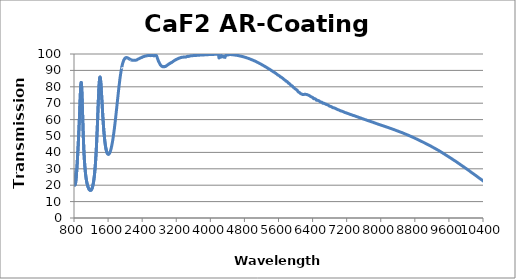
| Category | Transmission (%) |
|---|---|
| 200.0 | 0.033 |
| 201.0 | 0.027 |
| 202.0 | 0.167 |
| 203.0 | 0.082 |
| 204.0 | 0.026 |
| 205.0 | 0.047 |
| 206.0 | 0.007 |
| 207.0 | 0.018 |
| 208.0 | 0.015 |
| 209.0 | 0.054 |
| 210.0 | 0.017 |
| 211.0 | 0.037 |
| 212.0 | 0.004 |
| 213.0 | 0.027 |
| 214.0 | 0.066 |
| 215.0 | 0.053 |
| 216.0 | 0.029 |
| 217.0 | 0.021 |
| 218.0 | 0.008 |
| 219.0 | 0.008 |
| 220.0 | 0.019 |
| 221.0 | 0.018 |
| 222.0 | 0.022 |
| 223.0 | 0.002 |
| 224.0 | 0.004 |
| 225.0 | 0.002 |
| 226.0 | 0.004 |
| 227.0 | 0.005 |
| 228.0 | 0.017 |
| 229.0 | 0.013 |
| 230.0 | 0 |
| 231.0 | 0.016 |
| 232.0 | 0.002 |
| 233.0 | 0.011 |
| 234.0 | 0.014 |
| 235.0 | 0.017 |
| 236.0 | 0.003 |
| 237.0 | 0.003 |
| 238.0 | 0.008 |
| 239.0 | 0.016 |
| 240.0 | 0.025 |
| 241.0 | 0.003 |
| 242.0 | 0.002 |
| 243.0 | 0.017 |
| 244.0 | 0.006 |
| 245.0 | 0.002 |
| 246.0 | 0.021 |
| 247.0 | 0.016 |
| 248.0 | 0.028 |
| 249.0 | 0.011 |
| 250.0 | 0.015 |
| 251.0 | 0.023 |
| 252.0 | 0.007 |
| 253.0 | 0.01 |
| 254.0 | 0.027 |
| 255.0 | 0.018 |
| 256.0 | 0.022 |
| 257.0 | 0.023 |
| 258.0 | 0.031 |
| 259.0 | 0.031 |
| 260.0 | 0.016 |
| 261.0 | 0.036 |
| 262.0 | 0.011 |
| 263.0 | 0.002 |
| 264.0 | 0.042 |
| 265.0 | 0.028 |
| 266.0 | 0.01 |
| 267.0 | 0.006 |
| 268.0 | 0.004 |
| 269.0 | 0.027 |
| 270.0 | 0.057 |
| 271.0 | 0.071 |
| 272.0 | 0.015 |
| 273.0 | 0.032 |
| 274.0 | 0.012 |
| 275.0 | 0.021 |
| 276.0 | 0.032 |
| 277.0 | 0.045 |
| 278.0 | 0.02 |
| 279.0 | 0.052 |
| 280.0 | 0.111 |
| 281.0 | 0.018 |
| 282.0 | 0.074 |
| 283.0 | 0.111 |
| 284.0 | 0.049 |
| 285.0 | 0.11 |
| 286.0 | 0.096 |
| 287.0 | 0.013 |
| 288.0 | 0.062 |
| 289.0 | 0.074 |
| 290.0 | 0.068 |
| 291.0 | 0.09 |
| 292.0 | 0.079 |
| 293.0 | 0.039 |
| 294.0 | 0.057 |
| 295.0 | 0.016 |
| 296.0 | 0.049 |
| 297.0 | 0.02 |
| 298.0 | 0.048 |
| 299.0 | 0.026 |
| 300.0 | 0.107 |
| 301.0 | 0.006 |
| 302.0 | 0.021 |
| 303.0 | 0.059 |
| 304.0 | 0.002 |
| 305.0 | 0.089 |
| 306.0 | 0.003 |
| 307.0 | 0.089 |
| 308.0 | 0.062 |
| 309.0 | 0.141 |
| 310.0 | 0.074 |
| 311.0 | 0.009 |
| 312.0 | 0.006 |
| 313.0 | 0.021 |
| 314.0 | 0.014 |
| 315.0 | 0.157 |
| 316.0 | 0.097 |
| 317.0 | 0.043 |
| 318.0 | 0.079 |
| 319.0 | 0.043 |
| 320.0 | 0.047 |
| 321.0 | 0.052 |
| 322.0 | 0.001 |
| 323.0 | 0.1 |
| 324.0 | 0.015 |
| 325.0 | 0.006 |
| 326.0 | 0 |
| 327.0 | 0.063 |
| 328.0 | 0.081 |
| 329.0 | 0.046 |
| 330.0 | 0.069 |
| 331.0 | 0.044 |
| 332.0 | 0.093 |
| 333.0 | 0.023 |
| 334.0 | 0.093 |
| 335.0 | 0.002 |
| 336.0 | 0.102 |
| 337.0 | 0.052 |
| 338.0 | 0.014 |
| 339.0 | 0.044 |
| 340.0 | 0 |
| 341.0 | 0.047 |
| 342.0 | 0.032 |
| 343.0 | 0.06 |
| 344.0 | 0.025 |
| 345.0 | 0.042 |
| 346.0 | 0.011 |
| 347.0 | 0.087 |
| 348.0 | 0.039 |
| 349.0 | 0.083 |
| 350.0 | 0.086 |
| 351.0 | 0.006 |
| 352.0 | 0.047 |
| 353.0 | 0.011 |
| 354.0 | 0.018 |
| 355.0 | 0.041 |
| 356.0 | 0.07 |
| 357.0 | 0.045 |
| 358.0 | 0.006 |
| 359.0 | 0.012 |
| 360.0 | 0.06 |
| 361.0 | 0.018 |
| 362.0 | 0.067 |
| 363.0 | 0.032 |
| 364.0 | 0.031 |
| 365.0 | 0.077 |
| 366.0 | 0.008 |
| 367.0 | 0.008 |
| 368.0 | 0.013 |
| 369.0 | 0.021 |
| 370.0 | 0.013 |
| 371.0 | 0.044 |
| 372.0 | 0.007 |
| 373.0 | 0.009 |
| 374.0 | 0.004 |
| 375.0 | 0.061 |
| 376.0 | 0.032 |
| 377.0 | 0.003 |
| 378.0 | 0.01 |
| 379.0 | 0.014 |
| 380.0 | 0.018 |
| 381.0 | 0.02 |
| 382.0 | 0.007 |
| 383.0 | 0.005 |
| 384.0 | 0.026 |
| 385.0 | 0.003 |
| 386.0 | 0.034 |
| 387.0 | 0.017 |
| 388.0 | 0.03 |
| 389.0 | 0.006 |
| 390.0 | 0.011 |
| 391.0 | 0.006 |
| 392.0 | 0.009 |
| 393.0 | 0.007 |
| 394.0 | 0.01 |
| 395.0 | 0.013 |
| 396.0 | 0.015 |
| 397.0 | 0.019 |
| 398.0 | 0.001 |
| 399.0 | 0.004 |
| 400.0 | 0.003 |
| 401.0 | 0.026 |
| 402.0 | 0.017 |
| 403.0 | 0.009 |
| 404.0 | 0.012 |
| 405.0 | 0.011 |
| 406.0 | 0.004 |
| 407.0 | 0.009 |
| 408.0 | 0.007 |
| 409.0 | 0.016 |
| 410.0 | 0.004 |
| 411.0 | 0.002 |
| 412.0 | 0.001 |
| 413.0 | 0.003 |
| 414.0 | 0.007 |
| 415.0 | 0.012 |
| 416.0 | 0.012 |
| 417.0 | 0.01 |
| 418.0 | 0.003 |
| 419.0 | 0.016 |
| 420.0 | 0.01 |
| 421.0 | 0.011 |
| 422.0 | 0.008 |
| 423.0 | 0.001 |
| 424.0 | 0.008 |
| 425.0 | 0.007 |
| 426.0 | 0.009 |
| 427.0 | 0.006 |
| 428.0 | 0.007 |
| 429.0 | 0.007 |
| 430.0 | 0.014 |
| 431.0 | 0.011 |
| 432.0 | 0.01 |
| 433.0 | 0.011 |
| 434.0 | 0.005 |
| 435.0 | 0.002 |
| 436.0 | 0.001 |
| 437.0 | 0.006 |
| 438.0 | 0.006 |
| 439.0 | 0.015 |
| 440.0 | 0.008 |
| 441.0 | 0.013 |
| 442.0 | 0.009 |
| 443.0 | 0.007 |
| 444.0 | 0.016 |
| 445.0 | 0.017 |
| 446.0 | 0.011 |
| 447.0 | 0.013 |
| 448.0 | 0.012 |
| 449.0 | 0.019 |
| 450.0 | 0.018 |
| 451.0 | 0.023 |
| 452.0 | 0.023 |
| 453.0 | 0.027 |
| 454.0 | 0.038 |
| 455.0 | 0.049 |
| 456.0 | 0.054 |
| 457.0 | 0.074 |
| 458.0 | 0.096 |
| 459.0 | 0.117 |
| 460.0 | 0.154 |
| 461.0 | 0.196 |
| 462.0 | 0.257 |
| 463.0 | 0.325 |
| 464.0 | 0.414 |
| 465.0 | 0.526 |
| 466.0 | 0.673 |
| 467.0 | 0.835 |
| 468.0 | 1.047 |
| 469.0 | 1.292 |
| 470.0 | 1.572 |
| 471.0 | 1.907 |
| 472.0 | 2.293 |
| 473.0 | 2.732 |
| 474.0 | 3.243 |
| 475.0 | 3.814 |
| 476.0 | 4.452 |
| 477.0 | 5.146 |
| 478.0 | 5.889 |
| 479.0 | 6.687 |
| 480.0 | 7.515 |
| 481.0 | 8.355 |
| 482.0 | 9.21 |
| 483.0 | 10.075 |
| 484.0 | 10.935 |
| 485.0 | 11.788 |
| 486.0 | 12.61 |
| 487.0 | 13.417 |
| 488.0 | 14.18 |
| 489.0 | 14.876 |
| 490.0 | 15.496 |
| 491.0 | 16.009 |
| 492.0 | 16.396 |
| 493.0 | 16.64 |
| 494.0 | 16.73 |
| 495.0 | 16.663 |
| 496.0 | 16.438 |
| 497.0 | 16.077 |
| 498.0 | 15.589 |
| 499.0 | 15 |
| 500.0 | 14.341 |
| 501.0 | 13.627 |
| 502.0 | 12.887 |
| 503.0 | 12.142 |
| 504.0 | 11.401 |
| 505.0 | 10.683 |
| 506.0 | 9.993 |
| 507.0 | 9.339 |
| 508.0 | 8.737 |
| 509.0 | 8.187 |
| 510.0 | 7.676 |
| 511.0 | 7.223 |
| 512.0 | 6.819 |
| 513.0 | 6.469 |
| 514.0 | 6.171 |
| 515.0 | 5.917 |
| 516.0 | 5.719 |
| 517.0 | 5.559 |
| 518.0 | 5.451 |
| 519.0 | 5.386 |
| 520.0 | 5.369 |
| 521.0 | 5.394 |
| 522.0 | 5.472 |
| 523.0 | 5.597 |
| 524.0 | 5.772 |
| 525.0 | 5.998 |
| 526.0 | 6.283 |
| 527.0 | 6.618 |
| 528.0 | 7.008 |
| 529.0 | 7.45 |
| 530.0 | 7.938 |
| 531.0 | 8.46 |
| 532.0 | 9.001 |
| 533.0 | 9.568 |
| 534.0 | 10.151 |
| 535.0 | 10.737 |
| 536.0 | 11.33 |
| 537.0 | 11.935 |
| 538.0 | 12.531 |
| 539.0 | 13.115 |
| 540.0 | 13.662 |
| 541.0 | 14.165 |
| 542.0 | 14.628 |
| 543.0 | 15.046 |
| 544.0 | 15.427 |
| 545.0 | 15.786 |
| 546.0 | 16.136 |
| 547.0 | 16.461 |
| 548.0 | 16.75 |
| 549.0 | 16.989 |
| 550.0 | 17.15 |
| 551.0 | 17.202 |
| 552.0 | 17.142 |
| 553.0 | 16.961 |
| 554.0 | 16.674 |
| 555.0 | 16.29 |
| 556.0 | 15.832 |
| 557.0 | 15.316 |
| 558.0 | 14.752 |
| 559.0 | 14.171 |
| 560.0 | 13.566 |
| 561.0 | 12.956 |
| 562.0 | 12.362 |
| 563.0 | 11.796 |
| 564.0 | 11.267 |
| 565.0 | 10.791 |
| 566.0 | 10.373 |
| 567.0 | 10.022 |
| 568.0 | 9.73 |
| 569.0 | 9.508 |
| 570.0 | 9.358 |
| 571.0 | 9.271 |
| 572.0 | 9.246 |
| 573.0 | 9.281 |
| 574.0 | 9.377 |
| 575.0 | 9.53 |
| 576.0 | 9.752 |
| 577.0 | 10.033 |
| 578.0 | 10.372 |
| 579.0 | 10.781 |
| 580.0 | 11.255 |
| 581.0 | 11.797 |
| 582.0 | 12.41 |
| 583.0 | 13.091 |
| 584.0 | 13.855 |
| 585.0 | 14.699 |
| 586.0 | 15.608 |
| 587.0 | 16.615 |
| 588.0 | 17.701 |
| 589.0 | 18.865 |
| 590.0 | 20.124 |
| 591.0 | 21.474 |
| 592.0 | 22.923 |
| 593.0 | 24.473 |
| 594.0 | 26.105 |
| 595.0 | 27.857 |
| 596.0 | 29.736 |
| 597.0 | 31.72 |
| 598.0 | 33.804 |
| 599.0 | 36.019 |
| 600.0 | 38.36 |
| 601.0 | 40.806 |
| 602.0 | 43.331 |
| 603.0 | 45.99 |
| 604.0 | 48.732 |
| 605.0 | 51.514 |
| 606.0 | 54.374 |
| 607.0 | 57.284 |
| 608.0 | 60.188 |
| 609.0 | 63.08 |
| 610.0 | 65.935 |
| 611.0 | 68.758 |
| 612.0 | 71.517 |
| 613.0 | 74.132 |
| 614.0 | 76.629 |
| 615.0 | 78.992 |
| 616.0 | 81.182 |
| 617.0 | 83.187 |
| 618.0 | 84.996 |
| 619.0 | 86.604 |
| 620.0 | 87.993 |
| 621.0 | 89.145 |
| 622.0 | 90.085 |
| 623.0 | 90.801 |
| 624.0 | 91.263 |
| 625.0 | 91.48 |
| 626.0 | 91.474 |
| 627.0 | 91.25 |
| 628.0 | 90.79 |
| 629.0 | 90.109 |
| 630.0 | 89.24 |
| 631.0 | 88.144 |
| 632.0 | 86.879 |
| 633.0 | 85.461 |
| 634.0 | 83.873 |
| 635.0 | 82.158 |
| 636.0 | 80.351 |
| 637.0 | 78.481 |
| 638.0 | 76.52 |
| 639.0 | 74.516 |
| 640.0 | 72.505 |
| 641.0 | 70.496 |
| 642.0 | 68.497 |
| 643.0 | 66.522 |
| 644.0 | 64.595 |
| 645.0 | 62.719 |
| 646.0 | 60.908 |
| 647.0 | 59.145 |
| 648.0 | 57.493 |
| 649.0 | 55.9 |
| 650.0 | 54.371 |
| 651.0 | 52.936 |
| 652.0 | 51.592 |
| 653.0 | 50.34 |
| 654.0 | 49.158 |
| 655.0 | 48.064 |
| 656.0 | 47.051 |
| 657.0 | 46.122 |
| 658.0 | 45.275 |
| 659.0 | 44.511 |
| 660.0 | 43.82 |
| 661.0 | 43.22 |
| 662.0 | 42.686 |
| 663.0 | 42.224 |
| 664.0 | 41.846 |
| 665.0 | 41.531 |
| 666.0 | 41.29 |
| 667.0 | 41.122 |
| 668.0 | 41.017 |
| 669.0 | 40.983 |
| 670.0 | 41.003 |
| 671.0 | 41.094 |
| 672.0 | 41.248 |
| 673.0 | 41.47 |
| 674.0 | 41.748 |
| 675.0 | 42.069 |
| 676.0 | 42.465 |
| 677.0 | 42.913 |
| 678.0 | 43.413 |
| 679.0 | 43.96 |
| 680.0 | 44.553 |
| 681.0 | 45.188 |
| 682.0 | 45.879 |
| 683.0 | 46.598 |
| 684.0 | 47.348 |
| 685.0 | 48.126 |
| 686.0 | 48.926 |
| 687.0 | 49.751 |
| 688.0 | 50.576 |
| 689.0 | 51.422 |
| 690.0 | 52.256 |
| 691.0 | 53.061 |
| 692.0 | 53.875 |
| 693.0 | 54.653 |
| 694.0 | 55.398 |
| 695.0 | 56.1 |
| 696.0 | 56.743 |
| 697.0 | 57.337 |
| 698.0 | 57.861 |
| 699.0 | 58.309 |
| 700.0 | 58.673 |
| 701.0 | 58.945 |
| 702.0 | 59.144 |
| 703.0 | 59.247 |
| 704.0 | 59.255 |
| 705.0 | 59.166 |
| 706.0 | 58.988 |
| 707.0 | 58.741 |
| 708.0 | 58.407 |
| 709.0 | 57.985 |
| 710.0 | 57.5 |
| 711.0 | 56.956 |
| 712.0 | 56.34 |
| 713.0 | 55.691 |
| 714.0 | 54.998 |
| 715.0 | 54.27 |
| 716.0 | 53.501 |
| 717.0 | 52.718 |
| 718.0 | 51.932 |
| 719.0 | 51.137 |
| 720.0 | 50.395 |
| 721.0 | 49.564 |
| 722.0 | 48.768 |
| 723.0 | 48.002 |
| 724.0 | 47.218 |
| 725.0 | 46.456 |
| 726.0 | 45.724 |
| 727.0 | 44.992 |
| 728.0 | 44.286 |
| 729.0 | 43.632 |
| 730.0 | 42.979 |
| 731.0 | 42.343 |
| 732.0 | 41.753 |
| 733.0 | 41.164 |
| 734.0 | 40.61 |
| 735.0 | 40.089 |
| 736.0 | 39.585 |
| 737.0 | 39.091 |
| 738.0 | 38.641 |
| 739.0 | 38.202 |
| 740.0 | 37.779 |
| 741.0 | 37.381 |
| 742.0 | 37.013 |
| 743.0 | 36.638 |
| 744.0 | 36.302 |
| 745.0 | 35.97 |
| 746.0 | 35.649 |
| 747.0 | 35.338 |
| 748.0 | 35.06 |
| 749.0 | 34.777 |
| 750.0 | 34.506 |
| 751.0 | 34.247 |
| 752.0 | 33.988 |
| 753.0 | 33.729 |
| 754.0 | 33.499 |
| 755.0 | 33.259 |
| 756.0 | 33.022 |
| 757.0 | 32.799 |
| 758.0 | 32.563 |
| 759.0 | 32.332 |
| 760.0 | 32.11 |
| 761.0 | 31.88 |
| 762.0 | 31.644 |
| 763.0 | 31.414 |
| 764.0 | 31.184 |
| 765.0 | 30.939 |
| 766.0 | 30.7 |
| 767.0 | 30.457 |
| 768.0 | 30.213 |
| 769.0 | 29.96 |
| 770.0 | 29.718 |
| 771.0 | 29.449 |
| 772.0 | 29.189 |
| 773.0 | 28.932 |
| 774.0 | 28.667 |
| 775.0 | 28.397 |
| 776.0 | 28.131 |
| 777.0 | 27.855 |
| 778.0 | 27.57 |
| 779.0 | 27.302 |
| 780.0 | 27.033 |
| 781.0 | 26.749 |
| 782.0 | 26.471 |
| 783.0 | 26.197 |
| 784.0 | 25.924 |
| 785.0 | 25.643 |
| 786.0 | 25.38 |
| 787.0 | 25.113 |
| 788.0 | 24.841 |
| 789.0 | 24.592 |
| 790.0 | 24.327 |
| 791.0 | 24.077 |
| 792.0 | 23.831 |
| 793.0 | 23.587 |
| 794.0 | 23.352 |
| 795.0 | 23.126 |
| 796.0 | 22.904 |
| 797.0 | 22.683 |
| 798.0 | 22.476 |
| 799.0 | 22.284 |
| 800.0 | 22.074 |
| 801.0 | 21.892 |
| 802.0 | 21.713 |
| 803.0 | 21.55 |
| 804.0 | 21.385 |
| 805.0 | 21.24 |
| 806.0 | 21.095 |
| 807.0 | 20.964 |
| 808.0 | 20.845 |
| 809.0 | 20.722 |
| 810.0 | 20.615 |
| 811.0 | 20.526 |
| 812.0 | 20.442 |
| 813.0 | 20.364 |
| 814.0 | 20.298 |
| 815.0 | 20.235 |
| 816.0 | 20.193 |
| 817.0 | 20.155 |
| 818.0 | 20.128 |
| 819.0 | 20.106 |
| 820.0 | 20.1 |
| 821.0 | 20.103 |
| 822.0 | 20.112 |
| 823.0 | 20.135 |
| 824.0 | 20.162 |
| 825.0 | 20.198 |
| 826.0 | 20.253 |
| 827.0 | 20.312 |
| 828.0 | 20.38 |
| 829.0 | 20.463 |
| 830.0 | 20.543 |
| 831.0 | 20.644 |
| 832.0 | 20.752 |
| 833.0 | 20.867 |
| 834.0 | 20.991 |
| 835.0 | 21.125 |
| 836.0 | 21.272 |
| 837.0 | 21.426 |
| 838.0 | 21.592 |
| 839.0 | 21.76 |
| 840.0 | 21.941 |
| 841.0 | 22.14 |
| 842.0 | 22.341 |
| 843.0 | 22.541 |
| 844.0 | 22.76 |
| 845.0 | 22.987 |
| 846.0 | 23.223 |
| 847.0 | 23.475 |
| 848.0 | 23.732 |
| 849.0 | 23.983 |
| 850.0 | 24.254 |
| 851.0 | 24.541 |
| 852.0 | 24.824 |
| 853.0 | 25.119 |
| 854.0 | 25.431 |
| 855.0 | 25.733 |
| 856.0 | 26.049 |
| 857.0 | 26.39 |
| 858.0 | 26.717 |
| 859.0 | 27.053 |
| 860.0 | 27.415 |
| 861.0 | 27.768 |
| 862.0 | 28.133 |
| 863.0 | 28.5 |
| 864.0 | 28.879 |
| 865.0 | 29.249 |
| 866.0 | 29.652 |
| 867.0 | 30.057 |
| 868.0 | 30.441 |
| 869.0 | 30.854 |
| 870.0 | 31.267 |
| 871.0 | 31.685 |
| 872.0 | 32.112 |
| 873.0 | 32.545 |
| 874.0 | 32.966 |
| 875.0 | 33.396 |
| 876.0 | 33.846 |
| 877.0 | 34.284 |
| 878.0 | 34.743 |
| 879.0 | 35.195 |
| 880.0 | 35.648 |
| 881.0 | 36.099 |
| 882.0 | 36.569 |
| 883.0 | 37.04 |
| 884.0 | 37.484 |
| 885.0 | 37.977 |
| 886.0 | 38.453 |
| 887.0 | 38.926 |
| 888.0 | 39.406 |
| 889.0 | 39.892 |
| 890.0 | 40.368 |
| 891.0 | 40.865 |
| 892.0 | 41.374 |
| 893.0 | 41.853 |
| 894.0 | 42.332 |
| 895.0 | 42.849 |
| 896.0 | 43.342 |
| 897.0 | 43.858 |
| 898.0 | 44.368 |
| 899.0 | 44.87 |
| 900.0 | 45.378 |
| 901.0 | 45.898 |
| 902.0 | 46.427 |
| 903.0 | 46.931 |
| 904.0 | 47.472 |
| 905.0 | 48.002 |
| 906.0 | 48.521 |
| 907.0 | 49.068 |
| 908.0 | 49.624 |
| 909.0 | 50.14 |
| 910.0 | 50.702 |
| 911.0 | 51.275 |
| 912.0 | 51.822 |
| 913.0 | 52.392 |
| 914.0 | 52.97 |
| 915.0 | 53.523 |
| 916.0 | 54.112 |
| 917.0 | 54.723 |
| 918.0 | 55.303 |
| 919.0 | 55.892 |
| 920.0 | 56.501 |
| 921.0 | 57.129 |
| 922.0 | 57.728 |
| 923.0 | 58.378 |
| 924.0 | 59.012 |
| 925.0 | 59.617 |
| 926.0 | 60.276 |
| 927.0 | 60.922 |
| 928.0 | 61.571 |
| 929.0 | 62.238 |
| 930.0 | 62.906 |
| 931.0 | 63.559 |
| 932.0 | 64.222 |
| 933.0 | 64.923 |
| 934.0 | 65.582 |
| 935.0 | 66.284 |
| 936.0 | 66.988 |
| 937.0 | 67.664 |
| 938.0 | 68.342 |
| 939.0 | 69.02 |
| 940.0 | 69.695 |
| 941.0 | 70.379 |
| 942.0 | 71.077 |
| 943.0 | 71.753 |
| 944.0 | 72.396 |
| 945.0 | 73.071 |
| 946.0 | 73.734 |
| 947.0 | 74.359 |
| 948.0 | 75.002 |
| 949.0 | 75.626 |
| 950.0 | 76.209 |
| 951.0 | 76.801 |
| 952.0 | 77.369 |
| 953.0 | 77.918 |
| 954.0 | 78.453 |
| 955.0 | 78.959 |
| 956.0 | 79.414 |
| 957.0 | 79.873 |
| 958.0 | 80.308 |
| 959.0 | 80.7 |
| 960.0 | 81.04 |
| 961.0 | 81.391 |
| 962.0 | 81.676 |
| 963.0 | 81.931 |
| 964.0 | 82.139 |
| 965.0 | 82.308 |
| 966.0 | 82.446 |
| 967.0 | 82.538 |
| 968.0 | 82.61 |
| 969.0 | 82.612 |
| 970.0 | 82.582 |
| 971.0 | 82.492 |
| 972.0 | 82.379 |
| 973.0 | 82.203 |
| 974.0 | 81.995 |
| 975.0 | 81.731 |
| 976.0 | 81.427 |
| 977.0 | 81.092 |
| 978.0 | 80.704 |
| 979.0 | 80.294 |
| 980.0 | 79.815 |
| 981.0 | 79.309 |
| 982.0 | 78.781 |
| 983.0 | 78.207 |
| 984.0 | 77.6 |
| 985.0 | 76.99 |
| 986.0 | 76.302 |
| 987.0 | 75.588 |
| 988.0 | 74.901 |
| 989.0 | 74.172 |
| 990.0 | 73.37 |
| 991.0 | 72.628 |
| 992.0 | 71.805 |
| 993.0 | 70.968 |
| 994.0 | 70.177 |
| 995.0 | 69.347 |
| 996.0 | 68.466 |
| 997.0 | 67.629 |
| 998.0 | 66.76 |
| 999.0 | 65.887 |
| 1000.0 | 65.022 |
| 1000.9999999999999 | 64.162 |
| 1002.0 | 63.293 |
| 1002.9999999999999 | 62.426 |
| 1004.0 | 61.585 |
| 1004.9999999999999 | 60.71 |
| 1006.0 | 59.842 |
| 1006.9999999999999 | 59.012 |
| 1008.0 | 58.174 |
| 1008.9999999999999 | 57.319 |
| 1010.0 | 56.528 |
| 1010.9999999999999 | 55.687 |
| 1012.0 | 54.857 |
| 1012.9999999999999 | 54.094 |
| 1014.0 | 53.292 |
| 1014.9999999999999 | 52.513 |
| 1016.0 | 51.756 |
| 1016.9999999999999 | 51.016 |
| 1018.0 | 50.258 |
| 1018.9999999999999 | 49.54 |
| 1020.0 | 48.834 |
| 1020.9999999999999 | 48.123 |
| 1022.0 | 47.434 |
| 1022.9999999999999 | 46.769 |
| 1024.0 | 46.09 |
| 1025.0 | 45.428 |
| 1026.0 | 44.815 |
| 1027.0 | 44.181 |
| 1028.0 | 43.552 |
| 1029.0 | 42.972 |
| 1030.0 | 42.373 |
| 1031.0 | 41.784 |
| 1032.0 | 41.233 |
| 1033.0 | 40.68 |
| 1034.0 | 40.132 |
| 1035.0 | 39.606 |
| 1036.0 | 39.088 |
| 1037.0 | 38.566 |
| 1038.0 | 38.072 |
| 1039.0 | 37.603 |
| 1040.0 | 37.123 |
| 1041.0 | 36.659 |
| 1042.0 | 36.213 |
| 1043.0 | 35.761 |
| 1044.0 | 35.325 |
| 1045.0 | 34.912 |
| 1046.0 | 34.494 |
| 1047.0 | 34.081 |
| 1048.0 | 33.712 |
| 1049.0 | 33.323 |
| 1050.0 | 33.275 |
| 1051.0 | 32.914 |
| 1052.0 | 32.549 |
| 1053.0 | 32.192 |
| 1054.0 | 31.854 |
| 1055.0 | 31.515 |
| 1056.0 | 31.174 |
| 1057.0 | 30.852 |
| 1058.0 | 30.54 |
| 1059.0 | 30.233 |
| 1060.0 | 29.929 |
| 1061.0 | 29.631 |
| 1062.0 | 29.335 |
| 1063.0 | 29.049 |
| 1064.0 | 28.778 |
| 1065.0 | 28.504 |
| 1066.0 | 28.231 |
| 1067.0 | 27.975 |
| 1068.0 | 27.72 |
| 1069.0 | 27.465 |
| 1070.0 | 27.226 |
| 1071.0 | 26.985 |
| 1072.0 | 26.745 |
| 1073.0 | 26.519 |
| 1074.0 | 26.285 |
| 1075.0 | 26.062 |
| 1076.0 | 25.857 |
| 1077.0 | 25.652 |
| 1078.0 | 25.441 |
| 1079.0 | 25.253 |
| 1080.0 | 25.047 |
| 1081.0 | 24.854 |
| 1082.0 | 24.672 |
| 1083.0 | 24.49 |
| 1084.0 | 24.309 |
| 1085.0 | 24.127 |
| 1086.0 | 23.96 |
| 1087.0 | 23.804 |
| 1088.0 | 23.608 |
| 1089.0 | 23.469 |
| 1090.0 | 23.297 |
| 1091.0 | 23.139 |
| 1092.0 | 22.996 |
| 1093.0 | 22.847 |
| 1094.0 | 22.692 |
| 1095.0 | 22.555 |
| 1096.0 | 22.406 |
| 1097.0 | 22.277 |
| 1098.0 | 22.146 |
| 1099.0 | 22.002 |
| 1100.0 | 21.884 |
| 1101.0 | 21.741 |
| 1102.0 | 21.624 |
| 1103.0 | 21.486 |
| 1104.0 | 21.371 |
| 1105.0 | 21.25 |
| 1106.0 | 21.133 |
| 1107.0 | 21.013 |
| 1108.0 | 20.928 |
| 1109.0 | 20.805 |
| 1110.0 | 20.698 |
| 1111.0 | 20.592 |
| 1112.0 | 20.507 |
| 1113.0 | 20.364 |
| 1114.0 | 20.285 |
| 1115.0 | 20.199 |
| 1116.0 | 20.09 |
| 1117.0 | 19.984 |
| 1118.0 | 19.902 |
| 1119.0 | 19.811 |
| 1120.0 | 19.721 |
| 1121.0 | 19.621 |
| 1122.0 | 19.561 |
| 1123.0 | 19.461 |
| 1124.0 | 19.39 |
| 1125.0 | 19.294 |
| 1126.0 | 19.223 |
| 1127.0 | 19.129 |
| 1128.0 | 19.067 |
| 1129.0 | 18.994 |
| 1130.0 | 18.904 |
| 1131.0 | 18.849 |
| 1132.0 | 18.77 |
| 1133.0 | 18.702 |
| 1134.0 | 18.627 |
| 1135.0 | 18.568 |
| 1136.0 | 18.506 |
| 1137.0 | 18.427 |
| 1138.0 | 18.368 |
| 1139.0 | 18.304 |
| 1140.0 | 18.239 |
| 1141.0 | 18.188 |
| 1142.0 | 18.128 |
| 1143.0 | 18.074 |
| 1144.0 | 18.002 |
| 1145.0 | 17.978 |
| 1146.0 | 17.911 |
| 1147.0 | 17.849 |
| 1148.0 | 17.815 |
| 1149.0 | 17.763 |
| 1150.0 | 17.702 |
| 1151.0 | 17.677 |
| 1152.0 | 17.625 |
| 1153.0 | 17.583 |
| 1154.0 | 17.52 |
| 1155.0 | 17.493 |
| 1156.0 | 17.453 |
| 1157.0 | 17.392 |
| 1158.0 | 17.386 |
| 1159.0 | 17.34 |
| 1160.0 | 17.305 |
| 1161.0 | 17.276 |
| 1162.0 | 17.241 |
| 1163.0 | 17.204 |
| 1164.0 | 17.178 |
| 1165.0 | 17.152 |
| 1166.0 | 17.123 |
| 1167.0 | 17.097 |
| 1168.0 | 17.078 |
| 1169.0 | 17.049 |
| 1170.0 | 17.028 |
| 1171.0 | 17.007 |
| 1172.0 | 16.992 |
| 1173.0 | 16.966 |
| 1174.0 | 16.955 |
| 1175.0 | 16.938 |
| 1176.0 | 16.924 |
| 1177.0 | 16.905 |
| 1178.0 | 16.904 |
| 1179.0 | 16.893 |
| 1180.0 | 16.885 |
| 1181.0 | 16.873 |
| 1182.0 | 16.872 |
| 1183.0 | 16.868 |
| 1184.0 | 16.861 |
| 1185.0 | 16.862 |
| 1186.0 | 16.862 |
| 1187.0 | 16.864 |
| 1188.0 | 16.869 |
| 1189.0 | 16.872 |
| 1190.0 | 16.885 |
| 1191.0 | 16.885 |
| 1192.0 | 16.899 |
| 1193.0 | 16.906 |
| 1194.0 | 16.92 |
| 1195.0 | 16.933 |
| 1196.0 | 16.954 |
| 1197.0 | 16.966 |
| 1198.0 | 16.986 |
| 1199.0 | 17.008 |
| 1200.0 | 17.042 |
| 1201.0 | 17.033 |
| 1202.0 | 17.075 |
| 1203.0 | 17.103 |
| 1204.0 | 17.128 |
| 1205.0 | 17.16 |
| 1206.0 | 17.193 |
| 1207.0 | 17.226 |
| 1208.0 | 17.265 |
| 1209.0 | 17.305 |
| 1210.0 | 17.342 |
| 1211.0 | 17.385 |
| 1212.0 | 17.419 |
| 1213.0 | 17.473 |
| 1214.0 | 17.529 |
| 1215.0 | 17.572 |
| 1216.0 | 17.623 |
| 1217.0 | 17.673 |
| 1218.0 | 17.718 |
| 1219.0 | 17.785 |
| 1220.0 | 17.862 |
| 1221.0 | 17.913 |
| 1222.0 | 17.97 |
| 1223.0 | 18.039 |
| 1224.0 | 18.107 |
| 1225.0 | 18.175 |
| 1226.0 | 18.249 |
| 1227.0 | 18.305 |
| 1228.0 | 18.419 |
| 1229.0 | 18.479 |
| 1230.0 | 18.56 |
| 1231.0 | 18.647 |
| 1232.0 | 18.731 |
| 1233.0 | 18.822 |
| 1234.0 | 18.911 |
| 1235.0 | 19.005 |
| 1236.0 | 19.1 |
| 1237.0 | 19.2 |
| 1238.0 | 19.3 |
| 1239.0 | 19.403 |
| 1240.0 | 19.512 |
| 1241.0 | 19.618 |
| 1242.0 | 19.728 |
| 1243.0 | 19.844 |
| 1244.0 | 19.957 |
| 1245.0 | 20.079 |
| 1246.0 | 20.208 |
| 1247.0 | 20.329 |
| 1248.0 | 20.455 |
| 1249.0 | 20.593 |
| 1250.0 | 20.721 |
| 1251.0 | 20.838 |
| 1252.0 | 21.019 |
| 1253.0 | 21.144 |
| 1254.0 | 21.288 |
| 1255.0 | 21.439 |
| 1256.0 | 21.588 |
| 1257.0 | 21.747 |
| 1258.0 | 21.907 |
| 1259.0 | 22.067 |
| 1260.0 | 22.232 |
| 1261.0 | 22.405 |
| 1262.0 | 22.592 |
| 1263.0 | 22.746 |
| 1264.0 | 22.916 |
| 1265.0 | 23.115 |
| 1266.0 | 23.298 |
| 1267.0 | 23.493 |
| 1268.0 | 23.685 |
| 1269.0 | 23.878 |
| 1270.0 | 24.083 |
| 1271.0 | 24.295 |
| 1272.0 | 24.499 |
| 1273.0 | 24.717 |
| 1274.0 | 24.929 |
| 1275.0 | 25.15 |
| 1276.0 | 25.375 |
| 1277.0 | 25.615 |
| 1278.0 | 25.844 |
| 1279.0 | 26.079 |
| 1280.0 | 26.325 |
| 1281.0 | 26.572 |
| 1282.0 | 26.823 |
| 1283.0 | 27.082 |
| 1284.0 | 27.346 |
| 1285.0 | 27.602 |
| 1286.0 | 27.874 |
| 1287.0 | 28.159 |
| 1288.0 | 28.428 |
| 1289.0 | 28.712 |
| 1290.0 | 29.018 |
| 1291.0 | 29.298 |
| 1292.0 | 29.602 |
| 1293.0 | 29.912 |
| 1294.0 | 30.216 |
| 1295.0 | 30.527 |
| 1296.0 | 30.864 |
| 1297.0 | 31.185 |
| 1298.0 | 31.511 |
| 1299.0 | 31.847 |
| 1300.0 | 32.195 |
| 1301.0 | 32.538 |
| 1302.0 | 32.894 |
| 1303.0 | 33.264 |
| 1304.0 | 33.617 |
| 1305.0 | 33.995 |
| 1306.0 | 34.382 |
| 1307.0 | 34.752 |
| 1308.0 | 35.157 |
| 1309.0 | 35.556 |
| 1310.0 | 35.945 |
| 1311.0 | 36.362 |
| 1312.0 | 36.78 |
| 1313.0 | 37.194 |
| 1314.0 | 37.623 |
| 1315.0 | 38.069 |
| 1316.0 | 38.511 |
| 1317.0 | 38.949 |
| 1318.0 | 39.406 |
| 1319.0 | 39.865 |
| 1320.0 | 40.328 |
| 1321.0 | 40.808 |
| 1322.0 | 41.291 |
| 1323.0 | 41.763 |
| 1324.0 | 42.26 |
| 1325.0 | 42.763 |
| 1326.0 | 43.256 |
| 1327.0 | 43.785 |
| 1328.0 | 44.312 |
| 1329.0 | 44.819 |
| 1330.0 | 45.354 |
| 1331.0 | 45.901 |
| 1332.0 | 46.437 |
| 1333.0 | 46.991 |
| 1334.0 | 47.563 |
| 1335.0 | 48.116 |
| 1336.0 | 48.685 |
| 1337.0 | 49.267 |
| 1338.0 | 49.848 |
| 1339.0 | 50.429 |
| 1340.0 | 51.041 |
| 1341.0 | 51.637 |
| 1342.0 | 52.236 |
| 1343.0 | 52.84 |
| 1344.0 | 53.45 |
| 1345.0 | 54.055 |
| 1346.0 | 54.698 |
| 1347.0 | 55.335 |
| 1348.0 | 55.95 |
| 1349.0 | 56.587 |
| 1350.0 | 57.213 |
| 1351.0 | 57.845 |
| 1352.0 | 58.5 |
| 1353.0 | 59.174 |
| 1354.0 | 59.812 |
| 1355.0 | 60.469 |
| 1356.0 | 61.128 |
| 1357.0 | 61.79 |
| 1358.0 | 62.45 |
| 1359.0 | 63.135 |
| 1360.0 | 63.81 |
| 1361.0 | 64.496 |
| 1362.0 | 65.187 |
| 1363.0 | 65.904 |
| 1364.0 | 66.559 |
| 1365.0 | 67.273 |
| 1366.0 | 67.946 |
| 1367.0 | 68.586 |
| 1368.0 | 69.249 |
| 1369.0 | 69.907 |
| 1370.0 | 70.565 |
| 1371.0 | 71.215 |
| 1372.0 | 71.884 |
| 1373.0 | 72.474 |
| 1374.0 | 73.062 |
| 1375.0 | 73.635 |
| 1376.0 | 74.201 |
| 1377.0 | 74.755 |
| 1378.0 | 75.322 |
| 1379.0 | 75.88 |
| 1380.0 | 76.445 |
| 1381.0 | 77.056 |
| 1382.0 | 77.651 |
| 1383.0 | 78.219 |
| 1384.0 | 78.79 |
| 1385.0 | 79.327 |
| 1386.0 | 79.796 |
| 1387.0 | 80.253 |
| 1388.0 | 80.694 |
| 1389.0 | 81.076 |
| 1390.0 | 81.531 |
| 1391.0 | 81.908 |
| 1392.0 | 82.271 |
| 1393.0 | 82.65 |
| 1394.0 | 83.002 |
| 1395.0 | 83.33 |
| 1396.0 | 83.65 |
| 1397.0 | 83.977 |
| 1398.0 | 84.235 |
| 1399.0 | 84.498 |
| 1400.0 | 84.701 |
| 1401.0 | 84.931 |
| 1402.0 | 85.115 |
| 1403.0 | 85.283 |
| 1404.0 | 85.421 |
| 1405.0 | 85.566 |
| 1406.0 | 85.642 |
| 1407.0 | 85.769 |
| 1408.0 | 85.838 |
| 1409.0 | 85.867 |
| 1410.0 | 85.88 |
| 1411.0 | 85.931 |
| 1412.0 | 85.848 |
| 1413.0 | 85.779 |
| 1414.0 | 85.709 |
| 1415.0 | 85.667 |
| 1416.0 | 85.561 |
| 1417.0 | 85.45 |
| 1418.0 | 85.343 |
| 1419.0 | 85.156 |
| 1420.0 | 84.831 |
| 1421.0 | 84.784 |
| 1422.0 | 84.573 |
| 1423.0 | 84.349 |
| 1424.0 | 84.116 |
| 1425.0 | 83.85 |
| 1426.0 | 83.582 |
| 1427.0 | 83.316 |
| 1428.0 | 83.011 |
| 1429.0 | 82.693 |
| 1430.0 | 82.367 |
| 1431.0 | 82.047 |
| 1432.0 | 81.694 |
| 1433.0 | 81.412 |
| 1434.0 | 80.969 |
| 1435.0 | 80.575 |
| 1436.0 | 80.211 |
| 1437.0 | 79.826 |
| 1438.0 | 79.417 |
| 1439.0 | 78.99 |
| 1440.0 | 78.584 |
| 1441.0 | 78.15 |
| 1442.0 | 77.726 |
| 1443.0 | 77.299 |
| 1444.0 | 76.842 |
| 1445.0 | 76.399 |
| 1446.0 | 75.946 |
| 1447.0 | 75.489 |
| 1448.0 | 75.033 |
| 1449.0 | 74.575 |
| 1450.0 | 74.11 |
| 1451.0 | 73.639 |
| 1452.0 | 73.191 |
| 1453.0 | 72.713 |
| 1454.0 | 72.23 |
| 1455.0 | 71.762 |
| 1456.0 | 71.307 |
| 1457.0 | 70.827 |
| 1458.0 | 70.362 |
| 1459.0 | 69.936 |
| 1460.0 | 69.426 |
| 1461.0 | 68.947 |
| 1462.0 | 68.519 |
| 1463.0 | 68.044 |
| 1464.0 | 67.573 |
| 1465.0 | 67.082 |
| 1466.0 | 66.771 |
| 1467.0 | 66.2 |
| 1468.0 | 65.761 |
| 1469.0 | 65.309 |
| 1470.0 | 64.845 |
| 1471.0 | 64.409 |
| 1472.0 | 63.971 |
| 1473.0 | 63.538 |
| 1474.0 | 63.105 |
| 1475.0 | 62.649 |
| 1476.0 | 62.232 |
| 1477.0 | 61.823 |
| 1478.0 | 61.415 |
| 1479.0 | 60.986 |
| 1480.0 | 60.565 |
| 1481.0 | 60.17 |
| 1482.0 | 59.762 |
| 1483.0 | 59.369 |
| 1484.0 | 58.974 |
| 1485.0 | 58.57 |
| 1486.0 | 58.185 |
| 1487.0 | 57.814 |
| 1488.0 | 57.438 |
| 1489.0 | 57.049 |
| 1490.0 | 56.693 |
| 1491.0 | 56.318 |
| 1492.0 | 55.962 |
| 1493.0 | 55.615 |
| 1494.0 | 55.268 |
| 1495.0 | 54.915 |
| 1496.0 | 54.57 |
| 1497.0 | 54.25 |
| 1498.0 | 53.914 |
| 1499.0 | 53.572 |
| 1500.0 | 53.26 |
| 1501.0 | 52.946 |
| 1502.0 | 52.626 |
| 1503.0 | 52.29 |
| 1504.0 | 52.003 |
| 1505.0 | 51.7 |
| 1506.0 | 51.415 |
| 1507.0 | 51.172 |
| 1508.0 | 50.834 |
| 1509.0 | 50.559 |
| 1510.0 | 50.27 |
| 1511.0 | 49.994 |
| 1512.0 | 49.731 |
| 1513.0 | 49.387 |
| 1514.0 | 49.24 |
| 1515.0 | 48.942 |
| 1516.0 | 48.69 |
| 1517.0 | 48.434 |
| 1518.0 | 48.172 |
| 1519.0 | 47.953 |
| 1520.0 | 47.745 |
| 1521.0 | 47.479 |
| 1522.0 | 47.225 |
| 1523.0 | 47.024 |
| 1524.0 | 46.818 |
| 1525.0 | 46.583 |
| 1526.0 | 46.355 |
| 1527.0 | 46.154 |
| 1528.0 | 45.971 |
| 1529.0 | 45.766 |
| 1530.0 | 45.549 |
| 1531.0 | 45.317 |
| 1532.0 | 45.177 |
| 1533.0 | 44.983 |
| 1534.0 | 44.789 |
| 1535.0 | 44.599 |
| 1536.0 | 44.419 |
| 1537.0 | 44.196 |
| 1538.0 | 44.125 |
| 1539.0 | 43.907 |
| 1540.0 | 43.743 |
| 1541.0 | 43.541 |
| 1542.0 | 43.412 |
| 1543.0 | 43.261 |
| 1544.0 | 43.184 |
| 1545.0 | 42.965 |
| 1546.0 | 42.817 |
| 1547.0 | 42.622 |
| 1548.0 | 42.552 |
| 1549.0 | 42.405 |
| 1550.0 | 42.269 |
| 1551.0 | 42.117 |
| 1552.0 | 42.004 |
| 1553.0 | 41.881 |
| 1554.0 | 41.782 |
| 1555.0 | 41.617 |
| 1556.0 | 41.511 |
| 1557.0 | 41.405 |
| 1558.0 | 41.324 |
| 1559.0 | 41.166 |
| 1560.0 | 41.079 |
| 1561.0 | 40.976 |
| 1562.0 | 40.898 |
| 1563.0 | 40.761 |
| 1564.0 | 40.684 |
| 1565.0 | 40.588 |
| 1566.0 | 40.529 |
| 1567.0 | 40.379 |
| 1568.0 | 40.33 |
| 1569.0 | 40.25 |
| 1570.0 | 40.165 |
| 1571.0 | 40.096 |
| 1572.0 | 40.004 |
| 1573.0 | 39.946 |
| 1574.0 | 39.87 |
| 1575.0 | 39.807 |
| 1576.0 | 39.74 |
| 1577.0 | 39.671 |
| 1578.0 | 39.618 |
| 1579.0 | 39.556 |
| 1580.0 | 39.502 |
| 1581.0 | 39.442 |
| 1582.0 | 39.394 |
| 1583.0 | 39.349 |
| 1584.0 | 39.318 |
| 1585.0 | 39.237 |
| 1586.0 | 39.201 |
| 1587.0 | 39.166 |
| 1588.0 | 39.152 |
| 1589.0 | 39.081 |
| 1590.0 | 39.063 |
| 1591.0 | 39.033 |
| 1592.0 | 39.03 |
| 1593.0 | 38.951 |
| 1594.0 | 38.948 |
| 1595.0 | 38.923 |
| 1596.0 | 38.924 |
| 1597.0 | 38.858 |
| 1598.0 | 38.86 |
| 1599.0 | 38.85 |
| 1600.0 | 38.837 |
| 1601.0 | 38.818 |
| 1602.0 | 38.823 |
| 1603.0 | 38.811 |
| 1604.0 | 38.809 |
| 1605.0 | 38.81 |
| 1606.0 | 38.774 |
| 1607.0 | 38.795 |
| 1608.0 | 38.809 |
| 1609.0 | 38.803 |
| 1610.0 | 38.803 |
| 1611.0 | 38.791 |
| 1612.0 | 38.845 |
| 1613.0 | 38.837 |
| 1614.0 | 38.832 |
| 1615.0 | 38.869 |
| 1616.0 | 38.883 |
| 1617.0 | 38.898 |
| 1618.0 | 38.892 |
| 1619.0 | 38.953 |
| 1620.0 | 38.973 |
| 1621.0 | 38.984 |
| 1622.0 | 38.987 |
| 1623.0 | 39.07 |
| 1624.0 | 39.084 |
| 1625.0 | 39.11 |
| 1626.0 | 39.11 |
| 1627.0 | 39.207 |
| 1628.0 | 39.217 |
| 1629.0 | 39.257 |
| 1630.0 | 39.299 |
| 1631.0 | 39.333 |
| 1632.0 | 39.377 |
| 1633.0 | 39.423 |
| 1634.0 | 39.476 |
| 1635.0 | 39.535 |
| 1636.0 | 39.566 |
| 1637.0 | 39.622 |
| 1638.0 | 39.684 |
| 1639.0 | 39.736 |
| 1640.0 | 39.796 |
| 1641.0 | 39.844 |
| 1642.0 | 39.922 |
| 1643.0 | 39.973 |
| 1644.0 | 40.037 |
| 1645.0 | 40.086 |
| 1646.0 | 40.169 |
| 1647.0 | 40.28 |
| 1648.0 | 40.315 |
| 1649.0 | 40.386 |
| 1650.0 | 40.41 |
| 1651.0 | 40.554 |
| 1652.0 | 40.601 |
| 1653.0 | 40.686 |
| 1654.0 | 40.754 |
| 1655.0 | 40.854 |
| 1656.0 | 40.93 |
| 1657.0 | 40.999 |
| 1658.0 | 41.112 |
| 1659.0 | 41.196 |
| 1660.0 | 41.28 |
| 1661.0 | 41.362 |
| 1662.0 | 41.438 |
| 1663.0 | 41.57 |
| 1664.0 | 41.653 |
| 1665.0 | 41.723 |
| 1666.0 | 41.849 |
| 1667.0 | 41.944 |
| 1668.0 | 42.023 |
| 1669.0 | 42.139 |
| 1670.0 | 42.274 |
| 1671.0 | 42.344 |
| 1672.0 | 42.448 |
| 1673.0 | 42.565 |
| 1674.0 | 42.711 |
| 1675.0 | 42.762 |
| 1676.0 | 42.901 |
| 1677.0 | 43.013 |
| 1678.0 | 43.169 |
| 1679.0 | 43.219 |
| 1680.0 | 43.368 |
| 1681.0 | 43.487 |
| 1682.0 | 43.61 |
| 1683.0 | 43.738 |
| 1684.0 | 43.869 |
| 1685.0 | 43.99 |
| 1686.0 | 44.077 |
| 1687.0 | 44.248 |
| 1688.0 | 44.399 |
| 1689.0 | 44.5 |
| 1690.0 | 44.606 |
| 1691.0 | 44.792 |
| 1692.0 | 44.9 |
| 1693.0 | 45.019 |
| 1694.0 | 45.207 |
| 1695.0 | 45.33 |
| 1696.0 | 45.44 |
| 1697.0 | 45.618 |
| 1698.0 | 45.767 |
| 1699.0 | 45.893 |
| 1700.0 | 46.012 |
| 1701.0 | 46.217 |
| 1702.0 | 46.34 |
| 1703.0 | 46.495 |
| 1704.0 | 46.648 |
| 1705.0 | 46.798 |
| 1706.0 | 46.945 |
| 1707.0 | 47.113 |
| 1708.0 | 47.257 |
| 1709.0 | 47.425 |
| 1710.0 | 47.595 |
| 1711.0 | 47.754 |
| 1712.0 | 47.911 |
| 1713.0 | 48.058 |
| 1714.0 | 48.267 |
| 1715.0 | 48.418 |
| 1716.0 | 48.547 |
| 1717.0 | 48.766 |
| 1718.0 | 48.927 |
| 1719.0 | 49.097 |
| 1720.0 | 49.259 |
| 1721.0 | 49.444 |
| 1722.0 | 49.613 |
| 1723.0 | 49.792 |
| 1724.0 | 49.968 |
| 1725.0 | 50.156 |
| 1726.0 | 50.338 |
| 1727.0 | 50.545 |
| 1728.0 | 50.662 |
| 1729.0 | 50.888 |
| 1730.0 | 51.07 |
| 1731.0 | 51.26 |
| 1732.0 | 51.449 |
| 1733.0 | 51.653 |
| 1734.0 | 51.837 |
| 1735.0 | 52.021 |
| 1736.0 | 52.225 |
| 1737.0 | 52.391 |
| 1738.0 | 52.605 |
| 1739.0 | 52.809 |
| 1740.0 | 53.028 |
| 1741.0 | 53.168 |
| 1742.0 | 53.408 |
| 1743.0 | 53.626 |
| 1744.0 | 53.798 |
| 1745.0 | 53.999 |
| 1746.0 | 54.214 |
| 1747.0 | 54.452 |
| 1748.0 | 54.609 |
| 1749.0 | 54.833 |
| 1750.0 | 55.056 |
| 1751.0 | 55.292 |
| 1752.0 | 55.434 |
| 1753.0 | 55.68 |
| 1754.0 | 55.923 |
| 1755.0 | 56.085 |
| 1756.0 | 56.321 |
| 1757.0 | 56.544 |
| 1758.0 | 56.756 |
| 1759.0 | 56.928 |
| 1760.0 | 57.232 |
| 1761.0 | 57.428 |
| 1762.0 | 57.633 |
| 1763.0 | 57.861 |
| 1764.0 | 58.064 |
| 1765.0 | 58.321 |
| 1766.0 | 58.532 |
| 1767.0 | 58.742 |
| 1768.0 | 58.984 |
| 1769.0 | 59.219 |
| 1770.0 | 59.448 |
| 1771.0 | 59.678 |
| 1772.0 | 59.907 |
| 1773.0 | 60.134 |
| 1774.0 | 60.368 |
| 1775.0 | 60.59 |
| 1776.0 | 60.832 |
| 1777.0 | 61.032 |
| 1778.0 | 61.296 |
| 1779.0 | 61.592 |
| 1780.0 | 61.773 |
| 1781.0 | 61.996 |
| 1782.0 | 62.235 |
| 1783.0 | 62.494 |
| 1784.0 | 62.719 |
| 1785.0 | 62.95 |
| 1786.0 | 63.198 |
| 1787.0 | 63.429 |
| 1788.0 | 63.662 |
| 1789.0 | 63.928 |
| 1790.0 | 64.149 |
| 1791.0 | 64.39 |
| 1792.0 | 64.637 |
| 1793.0 | 64.878 |
| 1794.0 | 65.123 |
| 1795.0 | 65.369 |
| 1796.0 | 65.594 |
| 1797.0 | 65.847 |
| 1798.0 | 66.085 |
| 1799.0 | 66.322 |
| 1800.0 | 66.588 |
| 1801.0 | 66.813 |
| 1802.0 | 67.082 |
| 1803.0 | 67.301 |
| 1804.0 | 67.55 |
| 1805.0 | 67.782 |
| 1806.0 | 68.036 |
| 1807.0 | 68.274 |
| 1808.0 | 68.533 |
| 1809.0 | 68.777 |
| 1810.0 | 69.024 |
| 1811.0 | 69.277 |
| 1812.0 | 69.513 |
| 1813.0 | 69.746 |
| 1814.0 | 70 |
| 1815.0 | 70.244 |
| 1816.0 | 70.49 |
| 1817.0 | 70.739 |
| 1818.0 | 70.996 |
| 1819.0 | 71.247 |
| 1820.0 | 71.5 |
| 1821.0 | 71.745 |
| 1822.0 | 71.989 |
| 1823.0 | 72.229 |
| 1824.0 | 72.481 |
| 1825.0 | 72.724 |
| 1826.0 | 72.975 |
| 1827.0 | 73.217 |
| 1828.0 | 73.444 |
| 1829.0 | 73.682 |
| 1830.0 | 73.92 |
| 1831.0 | 74.163 |
| 1832.0 | 74.39 |
| 1833.0 | 74.639 |
| 1834.0 | 74.9 |
| 1835.0 | 75.136 |
| 1836.0 | 75.391 |
| 1837.0 | 75.647 |
| 1838.0 | 75.873 |
| 1839.0 | 76.131 |
| 1840.0 | 76.38 |
| 1841.0 | 76.614 |
| 1842.0 | 76.86 |
| 1843.0 | 77.114 |
| 1844.0 | 77.343 |
| 1845.0 | 77.576 |
| 1846.0 | 77.801 |
| 1847.0 | 78.039 |
| 1848.0 | 78.285 |
| 1849.0 | 78.513 |
| 1850.0 | 78.745 |
| 1851.0 | 78.955 |
| 1852.0 | 79.182 |
| 1853.0 | 79.421 |
| 1854.0 | 79.663 |
| 1855.0 | 79.893 |
| 1856.0 | 80.106 |
| 1857.0 | 80.323 |
| 1858.0 | 80.546 |
| 1859.0 | 80.77 |
| 1860.0 | 80.991 |
| 1861.0 | 81.205 |
| 1862.0 | 81.404 |
| 1863.0 | 81.592 |
| 1864.0 | 81.797 |
| 1865.0 | 82.005 |
| 1866.0 | 82.206 |
| 1867.0 | 82.416 |
| 1868.0 | 82.634 |
| 1869.0 | 82.87 |
| 1870.0 | 83.1 |
| 1871.0 | 83.342 |
| 1872.0 | 83.563 |
| 1873.0 | 83.814 |
| 1874.0 | 84.064 |
| 1875.0 | 84.281 |
| 1876.0 | 84.48 |
| 1877.0 | 84.677 |
| 1878.0 | 84.862 |
| 1879.0 | 85.065 |
| 1880.0 | 85.233 |
| 1881.0 | 85.406 |
| 1882.0 | 85.58 |
| 1883.0 | 85.762 |
| 1884.0 | 85.95 |
| 1885.0 | 86.135 |
| 1886.0 | 86.304 |
| 1887.0 | 86.477 |
| 1888.0 | 86.666 |
| 1889.0 | 86.863 |
| 1890.0 | 87.043 |
| 1891.0 | 87.211 |
| 1892.0 | 87.383 |
| 1893.0 | 87.543 |
| 1894.0 | 87.73 |
| 1895.0 | 87.891 |
| 1896.0 | 88.072 |
| 1897.0 | 88.222 |
| 1898.0 | 88.383 |
| 1899.0 | 88.563 |
| 1900.0 | 88.745 |
| 1901.0 | 88.928 |
| 1902.0 | 89.115 |
| 1903.0 | 89.263 |
| 1904.0 | 89.402 |
| 1905.0 | 89.586 |
| 1906.0 | 89.737 |
| 1907.0 | 89.97 |
| 1908.0 | 90.051 |
| 1909.0 | 90.206 |
| 1910.0 | 90.354 |
| 1911.0 | 90.483 |
| 1912.0 | 90.632 |
| 1913.0 | 90.776 |
| 1914.0 | 90.915 |
| 1915.0 | 91.061 |
| 1916.0 | 91.199 |
| 1917.0 | 91.319 |
| 1918.0 | 91.457 |
| 1919.0 | 91.592 |
| 1920.0 | 91.692 |
| 1921.0 | 91.935 |
| 1922.0 | 91.995 |
| 1923.0 | 91.952 |
| 1924.0 | 92.243 |
| 1925.0 | 92.379 |
| 1926.0 | 92.489 |
| 1927.0 | 92.636 |
| 1928.0 | 92.644 |
| 1929.0 | 92.838 |
| 1930.0 | 92.963 |
| 1931.0 | 93.074 |
| 1932.0 | 93.169 |
| 1933.0 | 93.281 |
| 1934.0 | 93.398 |
| 1935.0 | 93.51 |
| 1936.0 | 93.627 |
| 1937.0 | 93.72 |
| 1938.0 | 93.833 |
| 1939.0 | 93.919 |
| 1940.0 | 94.037 |
| 1941.0 | 94.132 |
| 1942.0 | 94.227 |
| 1943.0 | 94.318 |
| 1944.0 | 94.416 |
| 1945.0 | 94.505 |
| 1946.0 | 94.61 |
| 1947.0 | 94.695 |
| 1948.0 | 94.766 |
| 1949.0 | 94.848 |
| 1950.0 | 94.942 |
| 1951.0 | 95.006 |
| 1952.0 | 95.1 |
| 1953.0 | 95.196 |
| 1954.0 | 95.254 |
| 1955.0 | 95.321 |
| 1956.0 | 95.434 |
| 1957.0 | 95.493 |
| 1958.0 | 95.537 |
| 1959.0 | 95.621 |
| 1960.0 | 95.708 |
| 1961.0 | 95.777 |
| 1962.0 | 95.834 |
| 1963.0 | 95.907 |
| 1964.0 | 95.962 |
| 1965.0 | 95.936 |
| 1966.0 | 96.182 |
| 1967.0 | 96.157 |
| 1968.0 | 96.2 |
| 1969.0 | 96.267 |
| 1970.0 | 96.304 |
| 1971.0 | 96.382 |
| 1972.0 | 96.445 |
| 1973.0 | 96.52 |
| 1974.0 | 96.47 |
| 1975.0 | 96.585 |
| 1976.0 | 96.65 |
| 1977.0 | 96.677 |
| 1978.0 | 96.67 |
| 1979.0 | 96.796 |
| 1980.0 | 96.805 |
| 1981.0 | 96.818 |
| 1982.0 | 96.952 |
| 1983.0 | 96.939 |
| 1984.0 | 96.913 |
| 1985.0 | 97.077 |
| 1986.0 | 97.049 |
| 1987.0 | 97.094 |
| 1988.0 | 97.169 |
| 1989.0 | 97.064 |
| 1990.0 | 97.204 |
| 1991.0 | 97.201 |
| 1992.0 | 97.24 |
| 1993.0 | 97.255 |
| 1994.0 | 97.284 |
| 1995.0 | 97.328 |
| 1996.0 | 97.352 |
| 1997.0 | 97.375 |
| 1998.0 | 97.419 |
| 1999.0 | 97.408 |
| 2000.0 | 97.515 |
| 2001.0 | 97.475 |
| 2001.9999999999998 | 97.399 |
| 2003.0 | 97.503 |
| 2004.0 | 97.541 |
| 2005.0 | 97.63 |
| 2005.9999999999998 | 97.489 |
| 2007.0000000000002 | 97.56 |
| 2008.0 | 97.61 |
| 2009.0 | 97.597 |
| 2009.9999999999998 | 97.66 |
| 2011.0000000000002 | 97.638 |
| 2012.0 | 97.645 |
| 2013.0 | 97.691 |
| 2013.9999999999998 | 97.687 |
| 2015.0000000000002 | 97.672 |
| 2016.0 | 97.722 |
| 2017.0 | 97.696 |
| 2017.9999999999998 | 97.705 |
| 2019.0000000000002 | 97.742 |
| 2020.0 | 97.728 |
| 2021.0 | 97.685 |
| 2021.9999999999998 | 97.762 |
| 2023.0000000000002 | 97.768 |
| 2024.0 | 97.762 |
| 2025.0 | 97.757 |
| 2025.9999999999998 | 97.722 |
| 2027.0000000000002 | 97.737 |
| 2028.0 | 97.753 |
| 2029.0 | 97.811 |
| 2029.9999999999998 | 97.7 |
| 2031.0000000000002 | 97.738 |
| 2032.0 | 97.736 |
| 2033.0 | 97.762 |
| 2033.9999999999998 | 97.752 |
| 2035.0000000000002 | 97.749 |
| 2036.0 | 97.735 |
| 2037.0 | 97.738 |
| 2037.9999999999998 | 97.734 |
| 2039.0000000000002 | 97.739 |
| 2040.0 | 97.723 |
| 2041.0 | 97.739 |
| 2041.9999999999998 | 97.721 |
| 2043.0000000000002 | 97.672 |
| 2044.0 | 97.762 |
| 2045.0 | 97.719 |
| 2045.9999999999998 | 97.69 |
| 2047.0000000000002 | 97.739 |
| 2048.0 | 97.596 |
| 2049.0 | 97.669 |
| 2050.0 | 97.738 |
| 2051.0 | 97.643 |
| 2052.0 | 97.523 |
| 2053.0 | 97.618 |
| 2054.0 | 97.619 |
| 2055.0 | 97.561 |
| 2056.0 | 97.618 |
| 2057.0 | 97.59 |
| 2058.0 | 97.563 |
| 2059.0 | 97.544 |
| 2060.0 | 97.59 |
| 2061.0 | 97.53 |
| 2062.0 | 97.515 |
| 2063.0 | 97.539 |
| 2064.0 | 97.502 |
| 2065.0 | 97.504 |
| 2066.0 | 97.498 |
| 2067.0 | 97.455 |
| 2068.0 | 97.458 |
| 2069.0 | 97.517 |
| 2070.0 | 97.406 |
| 2071.0 | 97.413 |
| 2072.0 | 97.442 |
| 2073.0 | 97.425 |
| 2074.0 | 97.376 |
| 2075.0 | 97.361 |
| 2076.0 | 97.342 |
| 2077.0 | 97.373 |
| 2078.0 | 97.317 |
| 2079.0 | 97.301 |
| 2080.0 | 97.281 |
| 2081.0 | 97.294 |
| 2082.0 | 97.272 |
| 2083.0 | 97.212 |
| 2084.0 | 97.234 |
| 2085.0 | 97.241 |
| 2086.0 | 97.172 |
| 2087.0 | 97.181 |
| 2088.0 | 97.201 |
| 2089.0 | 97.164 |
| 2090.0 | 97.096 |
| 2091.0 | 97.172 |
| 2092.0 | 97.1 |
| 2093.0 | 97.006 |
| 2094.0 | 97.076 |
| 2095.0 | 97.07 |
| 2096.0 | 97.113 |
| 2097.0 | 97.032 |
| 2098.0 | 96.913 |
| 2099.0 | 96.992 |
| 2100.0 | 96.998 |
| 2101.0 | 96.972 |
| 2102.0 | 96.956 |
| 2103.0 | 96.939 |
| 2104.0 | 96.922 |
| 2105.0 | 96.881 |
| 2106.0 | 96.959 |
| 2107.0 | 96.876 |
| 2108.0 | 96.821 |
| 2109.0 | 96.897 |
| 2110.0 | 96.855 |
| 2111.0 | 96.836 |
| 2112.0 | 96.79 |
| 2113.0 | 96.796 |
| 2114.0 | 96.78 |
| 2115.0 | 96.77 |
| 2116.0 | 96.75 |
| 2117.0 | 96.741 |
| 2118.0 | 96.71 |
| 2119.0 | 96.702 |
| 2120.0 | 96.716 |
| 2121.0 | 96.7 |
| 2122.0 | 96.672 |
| 2123.0 | 96.632 |
| 2124.0 | 96.652 |
| 2125.0 | 96.635 |
| 2126.0 | 96.628 |
| 2127.0 | 96.596 |
| 2128.0 | 96.594 |
| 2129.0 | 96.582 |
| 2130.0 | 96.551 |
| 2131.0 | 96.573 |
| 2132.0 | 96.545 |
| 2133.0 | 96.518 |
| 2134.0 | 96.515 |
| 2135.0 | 96.514 |
| 2136.0 | 96.485 |
| 2137.0 | 96.484 |
| 2138.0 | 96.476 |
| 2139.0 | 96.455 |
| 2140.0 | 96.463 |
| 2141.0 | 96.45 |
| 2142.0 | 96.245 |
| 2143.0 | 96.543 |
| 2144.0 | 96.409 |
| 2145.0 | 96.399 |
| 2146.0 | 96.347 |
| 2147.0 | 96.409 |
| 2148.0 | 96.357 |
| 2149.0 | 96.359 |
| 2150.0 | 96.374 |
| 2151.0 | 96.325 |
| 2152.0 | 96.338 |
| 2153.0 | 96.348 |
| 2154.0 | 96.266 |
| 2155.0 | 96.304 |
| 2156.0 | 96.316 |
| 2157.0 | 96.283 |
| 2158.0 | 96.274 |
| 2159.0 | 96.273 |
| 2160.0 | 96.256 |
| 2161.0 | 96.259 |
| 2162.0 | 96.246 |
| 2163.0 | 96.246 |
| 2164.0 | 96.24 |
| 2165.0 | 96.223 |
| 2166.0 | 96.223 |
| 2167.0 | 96.209 |
| 2168.0 | 96.205 |
| 2169.0 | 96.199 |
| 2170.0 | 96.192 |
| 2171.0 | 96.197 |
| 2172.0 | 96.194 |
| 2173.0 | 96.181 |
| 2174.0 | 96.189 |
| 2175.0 | 96.197 |
| 2176.0 | 96.162 |
| 2177.0 | 96.152 |
| 2178.0 | 96.201 |
| 2179.0 | 96.158 |
| 2180.0 | 96.125 |
| 2181.0 | 96.217 |
| 2182.0 | 96.136 |
| 2183.0 | 96.181 |
| 2184.0 | 96.208 |
| 2185.0 | 96.165 |
| 2186.0 | 96.172 |
| 2187.0 | 96.174 |
| 2188.0 | 96.16 |
| 2189.0 | 96.166 |
| 2190.0 | 96.161 |
| 2191.0 | 96.164 |
| 2192.0 | 96.151 |
| 2193.0 | 96.15 |
| 2194.0 | 96.148 |
| 2195.0 | 96.152 |
| 2196.0 | 96.162 |
| 2197.0 | 96.15 |
| 2198.0 | 96.132 |
| 2199.0 | 96.138 |
| 2200.0 | 96.176 |
| 2201.0 | 96.115 |
| 2202.0 | 96.172 |
| 2203.0 | 96.141 |
| 2204.0 | 96.145 |
| 2205.0 | 96.131 |
| 2206.0 | 96.129 |
| 2207.0 | 96.128 |
| 2208.0 | 96.139 |
| 2209.0 | 96.117 |
| 2210.0 | 96.116 |
| 2211.0 | 96.095 |
| 2212.0 | 96.123 |
| 2213.0 | 96.143 |
| 2214.0 | 96.142 |
| 2215.0 | 96.144 |
| 2216.0 | 96.139 |
| 2217.0 | 96.132 |
| 2218.0 | 96.135 |
| 2219.0 | 96.128 |
| 2220.0 | 96.134 |
| 2221.0 | 96.148 |
| 2222.0 | 96.124 |
| 2223.0 | 96.143 |
| 2224.0 | 96.133 |
| 2225.0 | 96.141 |
| 2226.0 | 96.144 |
| 2227.0 | 96.143 |
| 2228.0 | 96.132 |
| 2229.0 | 96.157 |
| 2230.0 | 96.139 |
| 2231.0 | 96.16 |
| 2232.0 | 96.16 |
| 2233.0 | 96.155 |
| 2234.0 | 96.168 |
| 2235.0 | 96.172 |
| 2236.0 | 96.172 |
| 2237.0 | 96.166 |
| 2238.0 | 96.178 |
| 2239.0 | 96.178 |
| 2240.0 | 96.174 |
| 2241.0 | 96.178 |
| 2242.0 | 96.192 |
| 2243.0 | 96.188 |
| 2244.0 | 96.197 |
| 2245.0 | 96.193 |
| 2246.0 | 96.2 |
| 2247.0 | 96.213 |
| 2248.0 | 96.209 |
| 2249.0 | 96.215 |
| 2250.0 | 96.221 |
| 2251.0 | 96.217 |
| 2252.0 | 96.241 |
| 2253.0 | 96.223 |
| 2254.0 | 96.232 |
| 2255.0 | 96.232 |
| 2256.0 | 96.244 |
| 2257.0 | 96.25 |
| 2258.0 | 96.259 |
| 2259.0 | 96.265 |
| 2260.0 | 96.262 |
| 2261.0 | 96.267 |
| 2262.0 | 96.277 |
| 2263.0 | 96.291 |
| 2264.0 | 96.308 |
| 2265.0 | 96.313 |
| 2266.0 | 96.316 |
| 2267.0 | 96.328 |
| 2268.0 | 96.336 |
| 2269.0 | 96.37 |
| 2270.0 | 96.343 |
| 2271.0 | 96.363 |
| 2272.0 | 96.384 |
| 2273.0 | 96.408 |
| 2274.0 | 96.407 |
| 2275.0 | 96.422 |
| 2276.0 | 96.441 |
| 2277.0 | 96.461 |
| 2278.0 | 96.458 |
| 2279.0 | 96.479 |
| 2280.0 | 96.492 |
| 2281.0 | 96.511 |
| 2282.0 | 96.531 |
| 2283.0 | 96.536 |
| 2284.0 | 96.553 |
| 2285.0 | 96.571 |
| 2286.0 | 96.574 |
| 2287.0 | 96.597 |
| 2288.0 | 96.615 |
| 2289.0 | 96.627 |
| 2290.0 | 96.659 |
| 2291.0 | 96.65 |
| 2292.0 | 96.671 |
| 2293.0 | 96.686 |
| 2294.0 | 96.707 |
| 2295.0 | 96.715 |
| 2296.0 | 96.722 |
| 2297.0 | 96.754 |
| 2298.0 | 96.766 |
| 2299.0 | 96.767 |
| 2300.0 | 96.791 |
| 2301.0 | 96.805 |
| 2302.0 | 96.814 |
| 2303.0 | 96.835 |
| 2304.0 | 96.84 |
| 2305.0 | 96.852 |
| 2306.0 | 96.873 |
| 2307.0 | 96.884 |
| 2308.0 | 96.895 |
| 2309.0 | 96.916 |
| 2310.0 | 96.927 |
| 2311.0 | 96.944 |
| 2312.0 | 96.945 |
| 2313.0 | 96.979 |
| 2314.0 | 96.992 |
| 2315.0 | 97.003 |
| 2316.0 | 97.012 |
| 2317.0 | 97.005 |
| 2318.0 | 97.01 |
| 2319.0 | 97.03 |
| 2320.0 | 97.033 |
| 2321.0 | 97.1 |
| 2322.0 | 97.095 |
| 2323.0 | 97.103 |
| 2324.0 | 97.102 |
| 2325.0 | 97.156 |
| 2326.0 | 97.129 |
| 2327.0 | 97.19 |
| 2328.0 | 97.15 |
| 2329.0 | 97.194 |
| 2330.0 | 97.213 |
| 2331.0 | 97.217 |
| 2332.0 | 97.241 |
| 2333.0 | 97.267 |
| 2334.0 | 97.239 |
| 2335.0 | 97.267 |
| 2336.0 | 97.29 |
| 2337.0 | 97.305 |
| 2338.0 | 97.304 |
| 2339.0 | 97.324 |
| 2340.0 | 97.339 |
| 2341.0 | 97.354 |
| 2342.0 | 97.371 |
| 2343.0 | 97.367 |
| 2344.0 | 97.39 |
| 2345.0 | 97.4 |
| 2346.0 | 97.419 |
| 2347.0 | 97.445 |
| 2348.0 | 97.451 |
| 2349.0 | 97.458 |
| 2350.0 | 97.471 |
| 2351.0 | 97.475 |
| 2352.0 | 97.447 |
| 2353.0 | 97.47 |
| 2354.0 | 97.504 |
| 2355.0 | 97.535 |
| 2356.0 | 97.533 |
| 2357.0 | 97.593 |
| 2358.0 | 97.539 |
| 2359.0 | 97.574 |
| 2360.0 | 97.592 |
| 2361.0 | 97.613 |
| 2362.0 | 97.607 |
| 2363.0 | 97.625 |
| 2364.0 | 97.638 |
| 2365.0 | 97.653 |
| 2366.0 | 97.674 |
| 2367.0 | 97.651 |
| 2368.0 | 97.691 |
| 2369.0 | 97.685 |
| 2370.0 | 97.702 |
| 2371.0 | 97.764 |
| 2372.0 | 97.697 |
| 2373.0 | 97.77 |
| 2374.0 | 97.78 |
| 2375.0 | 97.741 |
| 2376.0 | 97.772 |
| 2377.0 | 97.786 |
| 2378.0 | 97.8 |
| 2379.0 | 97.805 |
| 2380.0 | 97.817 |
| 2381.0 | 97.834 |
| 2382.0 | 97.843 |
| 2383.0 | 97.848 |
| 2384.0 | 97.865 |
| 2385.0 | 97.883 |
| 2386.0 | 97.893 |
| 2387.0 | 97.95 |
| 2388.0 | 97.848 |
| 2389.0 | 97.927 |
| 2390.0 | 97.936 |
| 2391.0 | 97.934 |
| 2392.0 | 97.997 |
| 2393.0 | 97.979 |
| 2394.0 | 98.031 |
| 2395.0 | 98.003 |
| 2396.0 | 98.047 |
| 2397.0 | 98.022 |
| 2398.0 | 98.038 |
| 2399.0 | 98.044 |
| 2400.0 | 98.057 |
| 2401.0 | 98.06 |
| 2402.0 | 98.094 |
| 2403.0 | 98.08 |
| 2404.0 | 98.099 |
| 2405.0 | 98.118 |
| 2406.0 | 98.112 |
| 2407.0 | 98.131 |
| 2408.0 | 98.093 |
| 2409.0 | 98.133 |
| 2410.0 | 98.156 |
| 2411.0 | 98.166 |
| 2412.0 | 98.188 |
| 2413.0 | 98.191 |
| 2414.0 | 98.199 |
| 2415.0 | 98.196 |
| 2416.0 | 98.232 |
| 2417.0 | 98.245 |
| 2418.0 | 98.243 |
| 2419.0 | 98.241 |
| 2420.0 | 98.264 |
| 2421.0 | 98.28 |
| 2422.0 | 98.3 |
| 2423.0 | 98.303 |
| 2424.0 | 98.304 |
| 2425.0 | 98.316 |
| 2426.0 | 98.337 |
| 2427.0 | 98.355 |
| 2428.0 | 98.353 |
| 2429.0 | 98.345 |
| 2430.0 | 98.36 |
| 2431.0 | 98.386 |
| 2432.0 | 98.397 |
| 2433.0 | 98.391 |
| 2434.0 | 98.398 |
| 2435.0 | 98.397 |
| 2436.0 | 98.428 |
| 2437.0 | 98.403 |
| 2438.0 | 98.427 |
| 2439.0 | 98.422 |
| 2440.0 | 98.442 |
| 2441.0 | 98.463 |
| 2442.0 | 98.474 |
| 2443.0 | 98.481 |
| 2444.0 | 98.467 |
| 2445.0 | 98.48 |
| 2446.0 | 98.514 |
| 2447.0 | 98.532 |
| 2448.0 | 98.507 |
| 2449.0 | 98.552 |
| 2450.0 | 98.556 |
| 2451.0 | 98.555 |
| 2452.0 | 98.587 |
| 2453.0 | 98.591 |
| 2454.0 | 98.6 |
| 2455.0 | 98.594 |
| 2456.0 | 98.619 |
| 2457.0 | 98.587 |
| 2458.0 | 98.593 |
| 2459.0 | 98.633 |
| 2460.0 | 98.63 |
| 2461.0 | 98.651 |
| 2462.0 | 98.68 |
| 2463.0 | 98.669 |
| 2464.0 | 98.684 |
| 2465.0 | 98.695 |
| 2466.0 | 98.705 |
| 2467.0 | 98.739 |
| 2468.0 | 98.693 |
| 2469.0 | 98.693 |
| 2470.0 | 98.702 |
| 2471.0 | 98.717 |
| 2472.0 | 98.739 |
| 2473.0 | 98.732 |
| 2474.0 | 98.74 |
| 2475.0 | 98.745 |
| 2476.0 | 98.757 |
| 2477.0 | 98.767 |
| 2478.0 | 98.768 |
| 2479.0 | 98.74 |
| 2480.0 | 98.765 |
| 2481.0 | 98.773 |
| 2482.0 | 98.796 |
| 2483.0 | 98.779 |
| 2484.0 | 98.775 |
| 2485.0 | 98.77 |
| 2486.0 | 98.773 |
| 2487.0 | 98.813 |
| 2488.0 | 98.825 |
| 2489.0 | 98.829 |
| 2490.0 | 98.833 |
| 2491.0 | 98.84 |
| 2492.0 | 98.858 |
| 2493.0 | 98.834 |
| 2494.0 | 98.843 |
| 2495.0 | 98.841 |
| 2496.0 | 98.835 |
| 2497.0 | 98.87 |
| 2498.0 | 98.899 |
| 2499.0 | 98.871 |
| 2500.0 | 98.855 |
| 2500.225020251823 | 98.89 |
| 2501.432069859995 | 98.895 |
| 2502.6402855012034 | 98.896 |
| 2503.843399618414 | 98.903 |
| 2505.0539463367345 | 98.916 |
| 2506.265664160401 | 98.93 |
| 2507.47855478966 | 98.935 |
| 2508.6926199280506 | 98.937 |
| 2509.9078612824123 | 98.943 |
| 2511.1242805628935 | 98.952 |
| 2512.335567637098 | 98.964 |
| 2513.5543417880926 | 98.979 |
| 2514.774299006664 | 98.988 |
| 2515.9954410162604 | 98.985 |
| 2517.217769543679 | 98.978 |
| 2518.4412863190714 | 98.974 |
| 2519.659644375238 | 98.975 |
| 2520.885536671322 | 98.983 |
| 2522.112622417041 | 99 |
| 2523.3409033560433 | 99.02 |
| 2524.570381235373 | 99.032 |
| 2525.801057805483 | 99.035 |
| 2527.0329348202395 | 99.033 |
| 2528.259621924056 | 99.033 |
| 2529.493898860716 | 99.042 |
| 2530.7293815150465 | 99.054 |
| 2531.9660716546396 | 99.057 |
| 2533.2039710505446 | 99.052 |
| 2534.4430814772763 | 99.054 |
| 2535.676975038796 | 99.061 |
| 2536.9185065668134 | 99.059 |
| 2538.1612544608183 | 99.061 |
| 2539.4052205092526 | 99.075 |
| 2540.650406504065 | 99.091 |
| 2541.896814240723 | 99.093 |
| 2543.144445518217 | 99.076 |
| 2544.386828218268 | 99.056 |
| 2545.636905625603 | 99.068 |
| 2546.8882119825994 | 99.099 |
| 2548.1407491024174 | 99.114 |
| 2549.3945188017847 | 99.115 |
| 2550.6495229010065 | 99.124 |
| 2551.89925101757 | 99.125 |
| 2553.1567229722828 | 99.101 |
| 2554.4154347998233 | 99.085 |
| 2555.675388334875 | 99.1 |
| 2556.936585415745 | 99.131 |
| 2558.1990278843696 | 99.16 |
| 2559.462717586324 | 99.184 |
| 2560.7210990614954 | 99.185 |
| 2561.9872822951306 | 99.14 |
| 2563.254718311123 | 99.077 |
| 2564.523408969677 | 99.041 |
| 2565.7933561346836 | 99.057 |
| 2567.064561673726 | 99.12 |
| 2568.3304311199463 | 99.176 |
| 2569.60415248031 | 99.17 |
| 2570.8791378299725 | 99.137 |
| 2572.1553890513637 | 99.143 |
| 2573.4329080306547 | 99.151 |
| 2574.711696657767 | 99.128 |
| 2575.991756826378 | 99.108 |
| 2577.266448114472 | 99.096 |
| 2578.549050449312 | 99.101 |
| 2579.8329300194523 | 99.145 |
| 2581.1180887336777 | 99.194 |
| 2582.404528504581 | 99.199 |
| 2583.6922512485694 | 99.154 |
| 2584.9745767750373 | 99.11 |
| 2586.264864557309 | 99.118 |
| 2587.556441074871 | 99.132 |
| 2588.8493082594646 | 99.104 |
| 2590.143468046695 | 99.095 |
| 2591.438922376038 | 99.144 |
| 2592.735673190854 | 99.214 |
| 2594.026993444894 | 99.246 |
| 2595.326336333531 | 99.147 |
| 2596.626981550965 | 99.011 |
| 2597.928931056162 | 99.015 |
| 2599.2321868120157 | 99.087 |
| 2600.5367507853616 | 99.148 |
| 2601.835855379556 | 99.172 |
| 2603.1430349003385 | 99.16 |
| 2604.451528552602 | 99.122 |
| 2605.7613383190233 | 99.059 |
| 2607.07246618627 | 99.017 |
| 2608.3849141450105 | 99.031 |
| 2609.6986841899234 | 99.07 |
| 2611.0069609445577 | 99.114 |
| 2612.323374285856 | 99.157 |
| 2613.6411157111197 | 99.191 |
| 2614.960187231149 | 99.221 |
| 2616.280590860809 | 99.22 |
| 2617.6023286190316 | 99.14 |
| 2618.918543776533 | 99.06 |
| 2620.2429489262245 | 99.042 |
| 2621.5686942752804 | 99.05 |
| 2622.8957818590034 | 99.096 |
| 2624.2242137168196 | 99.175 |
| 2625.553991892289 | 99.228 |
| 2626.8851184331156 | 99.214 |
| 2628.2106878815835 | 99.169 |
| 2629.544510299926 | 99.142 |
| 2630.8796872410226 | 99.105 |
| 2632.216220769239 | 99.079 |
| 2633.5541129531357 | 99.094 |
| 2634.8933658654837 | 99.113 |
| 2636.2270318719843 | 99.129 |
| 2637.569005399104 | 99.154 |
| 2638.912345887519 | 99.182 |
| 2640.257055426916 | 99.201 |
| 2641.603136111243 | 99.197 |
| 2642.950590038719 | 99.174 |
| 2644.2994193118475 | 99.154 |
| 2645.6426265939995 | 99.134 |
| 2646.994205729684 | 99.119 |
| 2648.3471665333664 | 99.142 |
| 2649.7015111247715 | 99.192 |
| 2651.0572416279615 | 99.226 |
| 2652.414360171346 | 99.204 |
| 2653.765826395947 | 99.143 |
| 2655.1257202028514 | 99.106 |
| 2656.487008450285 | 99.106 |
| 2657.8496932841454 | 99.123 |
| 2659.213776854735 | 99.133 |
| 2660.5792613167737 | 99.113 |
| 2661.946148829409 | 99.098 |
| 2663.3073483313046 | 99.14 |
| 2664.6770411426137 | 99.202 |
| 2666.0481434973753 | 99.168 |
| 2667.42065757254 | 99.026 |
| 2668.7945855495445 | 98.943 |
| 2670.1699296143206 | 98.892 |
| 2671.5466919573087 | 98.937 |
| 2672.91773026518 | 98.957 |
| 2674.297328376969 | 99.033 |
| 2675.678351354027 | 98.996 |
| 2677.0608014049217 | 98.858 |
| 2678.4446807427857 | 99.048 |
| 2679.829991585334 | 98.934 |
| 2681.209547250956 | 98.941 |
| 2682.5977203284574 | 98.99 |
| 2683.987331579795 | 99.026 |
| 2685.3783832410904 | 99.05 |
| 2686.770877553104 | 99.099 |
| 2688.164816761245 | 99.196 |
| 2689.560203115587 | 98.932 |
| 2690.949797640575 | 99.077 |
| 2692.3480775288554 | 99.172 |
| 2693.7478113299035 | 99.125 |
| 2695.1490013125376 | 99.295 |
| 2696.5516497502995 | 99.101 |
| 2697.955758921465 | 99.064 |
| 2699.3540445771328 | 99.088 |
| 2700.761074470786 | 99.102 |
| 2702.169571949318 | 99.088 |
| 2703.579539310046 | 99.072 |
| 2704.9909788550854 | 99.076 |
| 2706.403892891359 | 99.1 |
| 2707.818283730615 | 99.135 |
| 2709.226813759621 | 99.154 |
| 2710.644157477583 | 99.109 |
| 2712.0629849507627 | 99.059 |
| 2713.4832985102976 | 99.093 |
| 2714.905100492212 | 99.164 |
| 2716.328393237429 | 99.225 |
| 2717.7457929295124 | 99.269 |
| 2719.1720664891955 | 99.293 |
| 2720.59983785225 | 99.241 |
| 2722.0291093792957 | 99.146 |
| 2723.459883435917 | 99.114 |
| 2724.892162392673 | 99.084 |
| 2726.3259486251136 | 99.03 |
| 2727.7538038526795 | 99.028 |
| 2729.190603942589 | 99.053 |
| 2730.628918452498 | 99.048 |
| 2732.0687497780195 | 99.02 |
| 2733.51010031982 | 98.992 |
| 2734.9529724836384 | 98.959 |
| 2736.3898808302206 | 98.93 |
| 2737.8357955603256 | 98.925 |
| 2739.2832391476445 | 98.885 |
| 2740.7322140182973 | 98.695 |
| 2742.182722603538 | 98.485 |
| 2743.6347673397713 | 98.423 |
| 2745.0883506685664 | 98.407 |
| 2746.5359315563246 | 98.355 |
| 2747.9925914119735 | 98.26 |
| 2749.4507972032584 | 98.14 |
| 2750.910551392511 | 98.008 |
| 2752.371856447294 | 97.886 |
| 2753.834714840415 | 97.79 |
| 2755.291537397572 | 97.631 |
| 2756.757501826352 | 97.359 |
| 2758.2250270306054 | 97.184 |
| 2759.6941155042373 | 97.158 |
| 2761.16476974647 | 97.172 |
| 2762.6369922618537 | 97.133 |
| 2764.1107855602854 | 97.012 |
| 2765.5785037114065 | 96.899 |
| 2767.0554379556997 | 96.83 |
| 2768.5339505318357 | 96.757 |
| 2770.0140439712027 | 96.65 |
| 2771.495720810607 | 96.486 |
| 2772.9789835922834 | 96.298 |
| 2774.4561372356984 | 96.158 |
| 2775.9425713000846 | 96.055 |
| 2777.430598952909 | 95.943 |
| 2778.920222758245 | 95.839 |
| 2780.4114452856734 | 95.756 |
| 2781.9042691102914 | 95.66 |
| 2783.39869681273 | 95.567 |
| 2784.886975362105 | 95.531 |
| 2786.384610240521 | 95.505 |
| 2787.8838567585276 | 95.381 |
| 2789.3847175190094 | 95.219 |
| 2790.88719513046 | 95.15 |
| 2792.3912922069944 | 95.138 |
| 2793.889205529666 | 95.11 |
| 2795.3965409763205 | 95.053 |
| 2796.9055037506505 | 94.978 |
| 2798.416096489387 | 94.898 |
| 2799.928321834961 | 94.828 |
| 2801.4421824355177 | 94.772 |
| 2802.957680944933 | 94.675 |
| 2804.4669549658697 | 94.493 |
| 2805.9857287565837 | 94.331 |
| 2807.506148438465 | 94.259 |
| 2809.0282166884367 | 94.225 |
| 2810.551936189229 | 94.188 |
| 2812.0773096293965 | 94.143 |
| 2813.5964233562263 | 94.082 |
| 2815.1251041596292 | 93.995 |
| 2816.655446989136 | 93.908 |
| 2818.1874545567275 | 93.829 |
| 2819.7211295802845 | 93.725 |
| 2821.2564747836095 | 93.601 |
| 2822.79349289644 | 93.525 |
| 2824.324209824694 | 93.501 |
| 2825.864573266191 | 93.475 |
| 2827.4066178279295 | 93.422 |
| 2828.950346263522 | 93.369 |
| 2830.4957613325973 | 93.339 |
| 2832.042865800817 | 93.31 |
| 2833.5836332209346 | 93.254 |
| 2835.1341160193583 | 93.172 |
| 2836.6862965358387 | 93.085 |
| 2838.2401775603053 | 93.013 |
| 2839.795761888805 | 92.973 |
| 2841.3530523235163 | 92.957 |
| 2842.9120516727694 | 92.932 |
| 2844.4646717487767 | 92.888 |
| 2846.0270884858282 | 92.846 |
| 2847.591222584816 | 92.82 |
| 2849.1570768788056 | 92.796 |
| 2850.7246542070993 | 92.762 |
| 2852.2939574152515 | 92.717 |
| 2853.8568448329493 | 92.657 |
| 2855.4295993832275 | 92.592 |
| 2857.00408837285 | 92.549 |
| 2858.580314672521 | 92.525 |
| 2860.15828115928 | 92.502 |
| 2861.737990716522 | 92.486 |
| 2863.3194462340193 | 92.483 |
| 2864.894442964249 | 92.482 |
| 2866.479390013186 | 92.47 |
| 2868.0660917150176 | 92.452 |
| 2869.6545509851526 | 92.437 |
| 2871.244770745461 | 92.416 |
| 2872.836753924295 | 92.381 |
| 2874.430503456503 | 92.356 |
| 2876.017750781558 | 92.359 |
| 2877.615032660931 | 92.363 |
| 2879.2140897220693 | 92.342 |
| 2880.814924925963 | 92.301 |
| 2882.4175412401887 | 92.262 |
| 2884.021941638932 | 92.247 |
| 2885.619802277331 | 92.258 |
| 2887.2277705115876 | 92.273 |
| 2888.837531777213 | 92.271 |
| 2890.4490890749694 | 92.264 |
| 2892.0624454123213 | 92.274 |
| 2893.6776038034495 | 92.297 |
| 2895.294567269274 | 92.311 |
| 2896.904946754887 | 92.317 |
| 2898.525520067941 | 92.316 |
| 2900.147907543285 | 92.299 |
| 2901.772112228938 | 92.27 |
| 2903.3981371797554 | 92.254 |
| 2905.0259854574397 | 92.251 |
| 2906.647211507998 | 92.237 |
| 2908.278706164969 | 92.207 |
| 2909.9120333592314 | 92.177 |
| 2911.54719618005 | 92.169 |
| 2913.1841977236377 | 92.179 |
| 2914.823041093175 | 92.19 |
| 2916.4637293988294 | 92.204 |
| 2918.097750438444 | 92.235 |
| 2919.742128375222 | 92.281 |
| 2921.3883606044938 | 92.314 |
| 2923.036450264535 | 92.317 |
| 2924.6864005007064 | 92.307 |
| 2926.338214465475 | 92.303 |
| 2927.9833222069965 | 92.297 |
| 2929.6388634173068 | 92.284 |
| 2931.296277839986 | 92.283 |
| 2932.9555686560902 | 92.303 |
| 2934.6167390538794 | 92.333 |
| 2936.279792228842 | 92.354 |
| 2937.9447313837136 | 92.353 |
| 2939.602918437777 | 92.337 |
| 2941.2716293762446 | 92.333 |
| 2942.942235929793 | 92.354 |
| 2944.614741330318 | 92.382 |
| 2946.289148817065 | 92.401 |
| 2947.9654616366515 | 92.421 |
| 2949.6349826708947 | 92.461 |
| 2951.3151060112386 | 92.519 |
| 2952.9971444517614 | 92.57 |
| 2954.68110126874 | 92.6 |
| 2956.3669797459297 | 92.613 |
| 2958.0547831745844 | 92.622 |
| 2959.744514853478 | 92.64 |
| 2961.427408010661 | 92.666 |
| 2963.120996082754 | 92.691 |
| 2964.8165223295155 | 92.7 |
| 2966.5139900799772 | 92.695 |
| 2968.213402670798 | 92.698 |
| 2969.914763446289 | 92.728 |
| 2971.6092452706844 | 92.784 |
| 2973.314502341485 | 92.842 |
| 2975.021717658539 | 92.889 |
| 2976.7308945969357 | 92.936 |
| 2978.4420365395267 | 92.986 |
| 2980.155146876946 | 93.022 |
| 2981.8702290076335 | 93.032 |
| 2983.57838457132 | 93.038 |
| 2985.2974102544968 | 93.066 |
| 2987.018417955565 | 93.118 |
| 2988.74141110437 | 93.168 |
| 2990.4663931386735 | 93.2 |
| 2992.193367504181 | 93.218 |
| 2993.9133741104333 | 93.231 |
| 2995.644333139615 | 93.252 |
| 2997.3772948669916 | 93.298 |
| 2999.1122627702202 | 93.367 |
| 3000.849240335015 | 93.434 |
| 3002.5882310551697 | 93.478 |
| 3004.329238432581 | 93.493 |
| 3006.0632295339697 | 93.493 |
| 3007.80827026962 | 93.511 |
| 3009.555338198781 | 93.558 |
| 3011.304436855957 | 93.616 |
| 3013.0555697838736 | 93.666 |
| 3014.808740533501 | 93.708 |
| 3016.5548530334477 | 93.742 |
| 3018.312099507713 | 93.759 |
| 3020.0713944877657 | 93.752 |
| 3021.8327415577546 | 93.737 |
| 3023.5961443101965 | 93.739 |
| 3025.3616063459986 | 93.775 |
| 3027.129131274482 | 93.84 |
| 3028.8895485137236 | 93.912 |
| 3030.661199353863 | 93.962 |
| 3032.4349239465323 | 93.978 |
| 3034.210725934916 | 93.977 |
| 3035.988608970739 | 93.984 |
| 3037.768576714289 | 94.019 |
| 3039.541393994474 | 94.081 |
| 3041.32553131957 | 94.146 |
| 3043.11176436577 | 94.195 |
| 3044.9000968278233 | 94.228 |
| 3046.6905324091704 | 94.254 |
| 3048.4830748219683 | 94.279 |
| 3050.277727787115 | 94.301 |
| 3052.065179903982 | 94.308 |
| 3053.864054187764 | 94.301 |
| 3055.665050219855 | 94.298 |
| 3057.468171756332 | 94.32 |
| 3059.2734225621416 | 94.372 |
| 3061.0808064111275 | 94.44 |
| 3062.880945817636 | 94.501 |
| 3064.6925960091576 | 94.543 |
| 3066.5063905993184 | 94.569 |
| 3068.322333397768 | 94.582 |
| 3070.140428223187 | 94.587 |
| 3071.9606789033096 | 94.599 |
| 3073.783089274956 | 94.629 |
| 3075.598203850649 | 94.665 |
| 3077.4249339123 | 94.682 |
| 3079.2538352106517 | 94.681 |
| 3081.084911619079 | 94.692 |
| 3082.9181670201747 | 94.732 |
| 3084.753605305776 | 94.784 |
| 3086.581703360979 | 94.823 |
| 3088.42150776738 | 94.841 |
| 3090.263506769222 | 94.84 |
| 3092.1077042955562 | 94.836 |
| 3093.954104284817 | 94.857 |
| 3095.8027106848535 | 94.913 |
| 3097.653527452954 | 94.979 |
| 3099.496951644748 | 95.031 |
| 3101.3521895546455 | 95.065 |
| 3103.209649740727 | 95.084 |
| 3105.0693361982776 | 95.093 |
| 3106.931252932166 | 95.107 |
| 3108.795403956875 | 95.138 |
| 3110.661793296524 | 95.177 |
| 3112.5207371694114 | 95.215 |
| 3114.391603600237 | 95.253 |
| 3116.2647204554737 | 95.286 |
| 3118.140091798044 | 95.312 |
| 3120.017721700659 | 95.336 |
| 3121.897614245843 | 95.37 |
| 3123.7700155563743 | 95.414 |
| 3125.654433897097 | 95.458 |
| 3127.541127165822 | 95.499 |
| 3129.430099484583 | 95.542 |
| 3131.3213549853767 | 95.582 |
| 3133.214897810196 | 95.614 |
| 3135.1107321110585 | 95.64 |
| 3136.9990212563052 | 95.668 |
| 3138.89943907867 | 95.706 |
| 3140.802160871887 | 95.746 |
| 3142.7071908283233 | 95.785 |
| 3144.6145331505268 | 95.824 |
| 3146.5241920512503 | 95.863 |
| 3148.4262591343713 | 95.899 |
| 3150.3405518136506 | 95.932 |
| 3152.257173749263 | 95.962 |
| 3154.1761291950543 | 95.992 |
| 3156.097422415235 | 96.027 |
| 3158.0210576844124 | 96.064 |
| 3159.9470392876215 | 96.099 |
| 3161.8653740961017 | 96.129 |
| 3163.796049051494 | 96.153 |
| 3165.7290832365147 | 96.172 |
| 3167.6644809781747 | 96.183 |
| 3169.6022466140726 | 96.186 |
| 3171.542384492426 | 96.192 |
| 3173.4748279976643 | 96.221 |
| 3175.419711100315 | 96.278 |
| 3177.3669795314017 | 96.345 |
| 3179.3166376818967 | 96.394 |
| 3181.2686899535533 | 96.416 |
| 3183.2231407589443 | 96.412 |
| 3185.1799945214902 | 96.411 |
| 3187.129097851238 | 96.443 |
| 3189.0907583338912 | 96.505 |
| 3191.054835086286 | 96.559 |
| 3193.021332575523 | 96.583 |
| 3194.990255279721 | 96.593 |
| 3196.9616076880534 | 96.617 |
| 3198.925161145855 | 96.655 |
| 3200.90137382687 | 96.68 |
| 3202.8800297227262 | 96.679 |
| 3204.861133367091 | 96.671 |
| 3206.8446893048526 | 96.675 |
| 3208.8307020921575 | 96.695 |
| 3210.819176296449 | 96.733 |
| 3212.799794380813 | 96.78 |
| 3214.7931923539363 | 96.823 |
| 3216.789065490608 | 96.861 |
| 3218.7874184037387 | 96.904 |
| 3220.7882557177045 | 96.945 |
| 3222.7915820683875 | 96.969 |
| 3224.787002818464 | 96.984 |
| 3226.7953082396216 | 97.014 |
| 3228.8061166503076 | 97.06 |
| 3230.8194327327237 | 97.097 |
| 3232.835261180761 | 97.108 |
| 3234.853606700029 | 97.1 |
| 3236.8744740078982 | 97.095 |
| 3238.887377408113 | 97.102 |
| 3240.913289364943 | 97.12 |
| 3242.9417373087476 | 97.138 |
| 3244.9727260042378 | 97.15 |
| 3247.0062602280696 | 97.16 |
| 3249.0423447688795 | 97.188 |
| 3251.0704149341173 | 97.243 |
| 3253.1116012465923 | 97.308 |
| 3255.1553522891877 | 97.356 |
| 3257.201672898779 | 97.37 |
| 3259.2505679244114 | 97.365 |
| 3261.3020422273385 | 97.372 |
| 3263.3561006810623 | 97.406 |
| 3265.4020852857716 | 97.454 |
| 3267.461313258051 | 97.494 |
| 3269.5231400500234 | 97.51 |
| 3271.587570584502 | 97.51 |
| 3273.654609796739 | 97.513 |
| 3275.7242626344682 | 97.527 |
| 3277.7857901430425 | 97.544 |
| 3279.8606715186743 | 97.562 |
| 3281.938181412415 | 97.579 |
| 3284.0183248222525 | 97.587 |
| 3286.101106758853 | 97.592 |
| 3288.186532245601 | 97.613 |
| 3290.274606318643 | 97.654 |
| 3292.35449439312 | 97.692 |
| 3294.4478670097287 | 97.706 |
| 3296.5439033717053 | 97.707 |
| 3298.6426085665744 | 97.725 |
| 3300.7439876948265 | 97.764 |
| 3302.8480458699537 | 97.807 |
| 3304.9438655284443 | 97.834 |
| 3307.0532832424997 | 97.844 |
| 3309.1653953956275 | 97.845 |
| 3311.28020715369 | 97.841 |
| 3313.3977236957635 | 97.834 |
| 3315.5179502141827 | 97.827 |
| 3317.6408919145774 | 97.826 |
| 3319.755533202535 | 97.84 |
| 3321.883906801225 | 97.879 |
| 3324.015011251791 | 97.93 |
| 3326.148851813416 | 97.972 |
| 3328.2854337587987 | 97.994 |
| 3330.4247623741935 | 98.005 |
| 3332.5557369947014 | 98.009 |
| 3334.700560563164 | 98.004 |
| 3336.848146714539 | 97.998 |
| 3338.9985007896735 | 97.998 |
| 3341.1516281431886 | 98 |
| 3343.307534143528 | 98.007 |
| 3345.4662241730007 | 98.029 |
| 3347.6164970540976 | 98.054 |
| 3349.7807568494645 | 98.059 |
| 3351.9478168763867 | 98.035 |
| 3354.117682573011 | 98.003 |
| 3356.2903593915717 | 97.99 |
| 3358.4658527984416 | 98.002 |
| 3360.6328743829035 | 98.02 |
| 3362.8140027575078 | 98.038 |
| 3364.9979641762316 | 98.066 |
| 3367.184764162379 | 98.101 |
| 3369.37440825362 | 98.132 |
| 3371.5669020020364 | 98.149 |
| 3373.7622509741736 | 98.143 |
| 3375.949063680527 | 98.128 |
| 3378.1501249915545 | 98.13 |
| 3380.3540582840646 | 98.151 |
| 3382.5608691828406 | 98.166 |
| 3384.770563327365 | 98.162 |
| 3386.9831463718638 | 98.149 |
| 3389.1986239853586 | 98.137 |
| 3391.40550018144 | 98.121 |
| 3393.6267689279534 | 98.097 |
| 3395.850949310133 | 98.081 |
| 3398.0780470565846 | 98.095 |
| 3400.3080679109526 | 98.135 |
| 3402.541017631968 | 98.171 |
| 3404.7653095272144 | 98.187 |
| 3407.0041190679794 | 98.18 |
| 3409.245874812492 | 98.152 |
| 3411.490582580247 | 98.113 |
| 3413.7382482060807 | 98.085 |
| 3415.9888775402146 | 98.089 |
| 3418.2424764483094 | 98.116 |
| 3420.4873510377756 | 98.144 |
| 3422.746891290136 | 98.154 |
| 3425.009418775902 | 98.145 |
| 3427.2749394229154 | 98.142 |
| 3429.5434591747144 | 98.159 |
| 3431.814983990583 | 98.191 |
| 3434.0777269152713 | 98.229 |
| 3436.3552641526294 | 98.275 |
| 3438.6358243957457 | 98.327 |
| 3440.919413667332 | 98.372 |
| 3443.2060380061084 | 98.406 |
| 3445.4957034668573 | 98.435 |
| 3447.7884161204793 | 98.465 |
| 3450.0722790142454 | 98.482 |
| 3452.3710884635566 | 98.482 |
| 3454.672963383921 | 98.48 |
| 3456.977909911156 | 98.493 |
| 3459.2859341974627 | 98.52 |
| 3461.5970424114867 | 98.548 |
| 3463.899242098846 | 98.571 |
| 3466.216520681181 | 98.588 |
| 3468.536901764098 | 98.6 |
| 3470.860391582469 | 98.608 |
| 3473.1869963878858 | 98.61 |
| 3475.51672244871 | 98.592 |
| 3477.8495760501364 | 98.556 |
| 3480.1734518448397 | 98.523 |
| 3482.512563164072 | 98.522 |
| 3484.8548209481596 | 98.55 |
| 3487.2002315500954 | 98.583 |
| 3489.5488013399868 | 98.605 |
| 3491.9005367051127 | 98.611 |
| 3494.243234271538 | 98.598 |
| 3496.601303532966 | 98.575 |
| 3498.962557601671 | 98.566 |
| 3501.327002934112 | 98.577 |
| 3503.6946460042113 | 98.604 |
| 3506.0654933034148 | 98.631 |
| 3508.43955134075 | 98.65 |
| 3510.8045008513704 | 98.663 |
| 3513.1849832421076 | 98.69 |
| 3515.568695970104 | 98.732 |
| 3517.95564561522 | 98.768 |
| 3520.345838775201 | 98.778 |
| 3522.739282065734 | 98.771 |
| 3525.123555580623 | 98.772 |
| 3527.523502125333 | 98.789 |
| 3529.9267187213195 | 98.815 |
| 3532.3332120565597 | 98.842 |
| 3534.7429888372817 | 98.865 |
| 3537.1560557880252 | 98.878 |
| 3539.5724196517062 | 98.882 |
| 3541.979541526168 | 98.887 |
| 3544.4025023481668 | 98.903 |
| 3546.8287803874555 | 98.921 |
| 3549.258382460985 | 98.932 |
| 3551.6913154043955 | 98.936 |
| 3554.127586072085 | 98.939 |
| 3556.554552211999 | 98.935 |
| 3558.997501583754 | 98.929 |
| 3561.4438093202984 | 98.932 |
| 3563.8934823515992 | 98.949 |
| 3566.3465276267034 | 98.967 |
| 3568.8029521138023 | 98.972 |
| 3571.2627628002983 | 98.96 |
| 3573.7131952212308 | 98.946 |
| 3576.179781709986 | 98.945 |
| 3578.6497754397265 | 98.956 |
| 3581.1231834752653 | 98.963 |
| 3583.6000129009603 | 98.961 |
| 3586.080270820782 | 98.962 |
| 3588.5510866132695 | 98.978 |
| 3591.0382050554635 | 99.005 |
| 3593.528773384888 | 99.027 |
| 3596.022798784544 | 99.04 |
| 3598.520288457386 | 99.044 |
| 3601.0212496263944 | 99.035 |
| 3603.5256895346406 | 99.017 |
| 3606.020612013818 | 99.009 |
| 3608.5320130917544 | 99.024 |
| 3611.046914721516 | 99.054 |
| 3613.565324227149 | 99.081 |
| 3616.087248953143 | 99.098 |
| 3618.612696264506 | 99.104 |
| 3621.1285609272986 | 99.104 |
| 3623.6610572393506 | 99.098 |
| 3626.197098317082 | 99.087 |
| 3628.7366916081833 | 99.083 |
| 3631.2798445812227 | 99.089 |
| 3633.8265647257185 | 99.093 |
| 3636.376859552217 | 99.084 |
| 3638.9174948236396 | 99.074 |
| 3641.4749430109173 | 99.083 |
| 3644.0359884994223 | 99.108 |
| 3646.6006388844316 | 99.134 |
| 3649.1689017826193 | 99.148 |
| 3651.740784832129 | 99.148 |
| 3654.302941713868 | 99.146 |
| 3656.88206921015 | 99.154 |
| 3659.4648398618187 | 99.169 |
| 3662.051261393557 | 99.178 |
| 3664.641341551902 | 99.169 |
| 3667.2350881053235 | 99.147 |
| 3669.8325088442966 | 99.13 |
| 3672.4201248622844 | 99.134 |
| 3675.0248982936855 | 99.151 |
| 3677.6333693741403 | 99.169 |
| 3680.245545982828 | 99.181 |
| 3682.861436021331 | 99.187 |
| 3685.4810474137134 | 99.195 |
| 3688.1043881066007 | 99.202 |
| 3690.717844620779 | 99.205 |
| 3693.3486484190616 | 99.208 |
| 3695.983205452315 | 99.215 |
| 3698.6215237580955 | 99.224 |
| 3701.2636113969306 | 99.231 |
| 3703.9094764523957 | 99.235 |
| 3706.545388501555 | 99.24 |
| 3709.1988130563795 | 99.246 |
| 3711.8560393753687 | 99.25 |
| 3714.5170756349967 | 99.255 |
| 3717.1819300352017 | 99.262 |
| 3719.8506107994704 | 99.27 |
| 3722.5231261749213 | 99.273 |
| 3725.1856073728877 | 99.27 |
| 3727.865796831314 | 99.264 |
| 3730.5498457417634 | 99.251 |
| 3733.2377624466153 | 99.239 |
| 3735.929555312305 | 99.235 |
| 3738.6252327294205 | 99.243 |
| 3741.310805653869 | 99.256 |
| 3744.014257206292 | 99.273 |
| 3746.721618583739 | 99.289 |
| 3749.432898274136 | 99.295 |
| 3752.1481047899924 | 99.297 |
| 3754.867246668494 | 99.303 |
| 3757.5903324715923 | 99.315 |
| 3760.3032308525358 | 99.326 |
| 3763.034209744001 | 99.336 |
| 3765.7691583505934 | 99.345 |
| 3768.508085334097 | 99.351 |
| 3771.250999381515 | 99.352 |
| 3773.9979092051585 | 99.352 |
| 3776.734559764936 | 99.356 |
| 3779.4894665628567 | 99.364 |
| 3782.2483953811184 | 99.371 |
| 3785.011355034065 | 99.371 |
| 3787.7783543618157 | 99.364 |
| 3790.5494022303596 | 99.361 |
| 3793.324507531646 | 99.365 |
| 3796.089268835246 | 99.372 |
| 3798.8724946435896 | 99.378 |
| 3801.6598046707195 | 99.383 |
| 3804.4512079132583 | 99.383 |
| 3807.2467133942746 | 99.377 |
| 3810.046330163375 | 99.375 |
| 3812.8355295265987 | 99.385 |
| 3815.643374707626 | 99.398 |
| 3818.4553584384043 | 99.408 |
| 3821.271489875541 | 99.415 |
| 3824.091778202677 | 99.423 |
| 3826.916232630584 | 99.428 |
| 3829.7448623972673 | 99.428 |
| 3832.562988172711 | 99.43 |
| 3835.39997468636 | 99.437 |
| 3838.2411643688392 | 99.446 |
| 3841.086566567951 | 99.449 |
| 3843.936190659235 | 99.451 |
| 3846.7900460460764 | 99.456 |
| 3849.633322426039 | 99.464 |
| 3852.4956466799194 | 99.465 |
| 3855.362230558372 | 99.462 |
| 3858.233083577045 | 99.463 |
| 3861.10821527995 | 99.47 |
| 3863.9876352395677 | 99.476 |
| 3866.871353056955 | 99.478 |
| 3869.7444033821566 | 99.484 |
| 3872.636723439521 | 99.496 |
| 3875.533370280085 | 99.503 |
| 3878.4343536201304 | 99.502 |
| 3881.3396832050553 | 99.498 |
| 3884.249368809478 | 99.499 |
| 3887.1483102566294 | 99.503 |
| 3890.066714644156 | 99.507 |
| 3892.9895045002963 | 99.515 |
| 3895.9166897175073 | 99.528 |
| 3898.8482802180233 | 99.542 |
| 3901.784285953967 | 99.55 |
| 3904.724716907458 | 99.555 |
| 3907.654313268831 | 99.557 |
| 3910.6036016659173 | 99.56 |
| 3913.5573453557818 | 99.565 |
| 3916.5155544415247 | 99.573 |
| 3919.478239056816 | 99.583 |
| 3922.4454093660156 | 99.59 |
| 3925.4016667255473 | 99.593 |
| 3928.3778156647995 | 99.594 |
| 3931.358480923083 | 99.596 |
| 3934.343672788506 | 99.595 |
| 3937.3334015804458 | 99.589 |
| 3940.327677649673 | 99.585 |
| 3943.3265113784687 | 99.588 |
| 3946.314339722416 | 99.597 |
| 3949.3222962939562 | 99.606 |
| 3952.3348418077976 | 99.614 |
| 3955.3519867733035 | 99.622 |
| 3958.373741731947 | 99.631 |
| 3961.400117257443 | 99.636 |
| 3964.4154073040386 | 99.634 |
| 3967.4510317356403 | 99.63 |
| 3970.4913085945254 | 99.632 |
| 3973.5362485844275 | 99.644 |
| 3976.5858624419425 | 99.66 |
| 3979.6401609366485 | 99.67 |
| 3982.699154871239 | 99.669 |
| 3985.7469688394303 | 99.665 |
| 3988.815361725721 | 99.666 |
| 3991.88848260335 | 99.669 |
| 3994.9663424085647 | 99.672 |
| 3998.04895211137 | 99.677 |
| 4001.136322715651 | 99.683 |
| 4004.212431477915 | 99.689 |
| 4007.309332221973 | 99.691 |
| 4010.4110270261594 | 99.69 |
| 4013.5175270310406 | 99.691 |
| 4016.628843411724 | 99.697 |
| 4019.744987378001 | 99.702 |
| 4022.865970174472 | 99.708 |
| 4025.9755945359457 | 99.717 |
| 4029.1062636485976 | 99.725 |
| 4032.2418054765903 | 99.728 |
| 4035.3822314049585 | 99.726 |
| 4038.5275528542293 | 99.723 |
| 4041.6777812805653 | 99.721 |
| 4044.8165675686605 | 99.719 |
| 4047.9766188870494 | 99.721 |
| 4051.1416117061785 | 99.731 |
| 4054.311557625957 | 99.741 |
| 4057.4864682826287 | 99.741 |
| 4060.6663553489125 | 99.736 |
| 4063.8512305341533 | 99.739 |
| 4067.0245648283717 | 99.75 |
| 4070.21942552923 | 99.76 |
| 4073.419309636895 | 99.767 |
| 4076.6242290084424 | 99.77 |
| 4079.834195538293 | 99.768 |
| 4083.049221158361 | 99.766 |
| 4086.269317838201 | 99.766 |
| 4089.4777736882997 | 99.77 |
| 4092.7080221169945 | 99.776 |
| 4095.943377678747 | 99.782 |
| 4099.183852494968 | 99.788 |
| 4102.429458725457 | 99.791 |
| 4105.680208568555 | 99.795 |
| 4108.919230974677 | 99.8 |
| 4112.180277983387 | 99.805 |
| 4115.4465053686 | 99.806 |
| 4118.717925484155 | 99.807 |
| 4121.994550723204 | 99.812 |
| 4125.276393518366 | 99.816 |
| 4128.563466341886 | 99.816 |
| 4131.838709544134 | 99.815 |
| 4135.136252739528 | 99.819 |
| 4138.439063554009 | 99.828 |
| 4141.747154619705 | 99.834 |
| 4145.0605386091665 | 99.83 |
| 4148.379228235529 | 99.817 |
| 4151.685999684471 | 99.809 |
| 4155.015311231422 | 99.815 |
| 4158.3499667332 | 99.828 |
| 4161.689979066699 | 99.839 |
| 4165.035361150216 | 99.847 |
| 4168.386125943618 | 99.853 |
| 4171.7422864485125 | 99.855 |
| 4175.086424288983 | 99.858 |
| 4178.453387263238 | 99.857 |
| 4181.825785137791 | 99.84 |
| 4185.20363108267 | 99.782 |
| 4188.586938310492 | 99.651 |
| 4191.975720076629 | 99.395 |
| 4195.352388623882 | 98.977 |
| 4198.7521308667065 | 98.385 |
| 4202.157387602795 | 97.649 |
| 4205.568172260072 | 97.804 |
| 4208.984498310093 | 98.844 |
| 4212.406379268221 | 99.236 |
| 4215.833828693808 | 99.484 |
| 4219.249058052647 | 98.15 |
| 4222.687656239444 | 98.319 |
| 4226.1318637664135 | 98.575 |
| 4229.581694370427 | 99.046 |
| 4233.037161833244 | 98.361 |
| 4236.498279981698 | 98.075 |
| 4239.947085460374 | 98.24 |
| 4243.419517183727 | 98.948 |
| 4246.897641273051 | 98.68 |
| 4250.381471737089 | 98.681 |
| 4253.871022630594 | 98.458 |
| 4257.366308054512 | 99.094 |
| 4260.86734215617 | 98.93 |
| 4264.355954320219 | 98.087 |
| 4267.868498435826 | 98.64 |
| 4271.386833877224 | 98.229 |
| 4274.910974978946 | 98.298 |
| 4278.440936122877 | 98.5 |
| 4281.976731738439 | 98.695 |
| 4285.50001071375 | 98.887 |
| 4289.047488333791 | 99.104 |
| 4292.6008439253255 | 99.389 |
| 4296.160092109672 | 98.259 |
| 4299.725247556681 | 98.679 |
| 4303.296324984938 | 99.126 |
| 4306.873339161969 | 98.144 |
| 4310.437724950969 | 98.764 |
| 4314.026626172336 | 99.409 |
| 4317.621508663307 | 98.455 |
| 4321.222387388944 | 98.857 |
| 4324.829277364276 | 99.166 |
| 4328.442193654503 | 99.475 |
| 4332.042384702691 | 98.34 |
| 4335.667367599558 | 97.245 |
| 4339.298422231094 | 97.628 |
| 4342.935563865039 | 97.935 |
| 4346.578807820364 | 98.164 |
| 4350.228169467488 | 98.349 |
| 4353.883664228491 | 98.523 |
| 4357.52631945897 | 98.697 |
| 4361.1940949431955 | 98.865 |
| 4364.868050038847 | 99.023 |
| 4368.548200376568 | 99.175 |
| 4372.234561639762 | 99.324 |
| 4375.927149564814 | 99.454 |
| 4379.606798901595 | 99.531 |
| 4383.311855105243 | 99.54 |
| 4387.023185417535 | 99.508 |
| 4390.740805788753 | 99.477 |
| 4394.464732223291 | 99.461 |
| 4398.194980779888 | 99.445 |
| 4401.93156757185 | 99.427 |
| 4405.655098884929 | 99.412 |
| 4409.404377656666 | 99.408 |
| 4413.160043248969 | 99.416 |
| 4416.922111995477 | 99.436 |
| 4420.690600285577 | 99.464 |
| 4424.465524564634 | 99.49 |
| 4428.2272920504465 | 99.514 |
| 4432.015104307476 | 99.535 |
| 4435.809402141609 | 99.556 |
| 4439.610202224246 | 99.574 |
| 4443.41752128397 | 99.594 |
| 4447.231376106804 | 99.612 |
| 4451.05178353645 | 99.626 |
| 4454.858914618175 | 99.64 |
| 4458.692443853915 | 99.659 |
| 4462.532576487808 | 99.672 |
| 4466.379329596463 | 99.674 |
| 4470.23272031542 | 99.666 |
| 4474.092765839407 | 99.659 |
| 4477.939431391251 | 99.653 |
| 4481.812803642818 | 99.647 |
| 4485.692882551103 | 99.636 |
| 4489.579685549838 | 99.624 |
| 4493.4732301332315 | 99.614 |
| 4497.373533856228 | 99.611 |
| 4501.280614334778 | 99.607 |
| 4505.1741925601555 | 99.6 |
| 4509.094844300956 | 99.59 |
| 4513.022325921446 | 99.581 |
| 4516.956655283936 | 99.572 |
| 4520.897850313072 | 99.561 |
| 4524.845928996117 | 99.543 |
| 4528.780399438431 | 99.527 |
| 4532.7422637421405 | 99.514 |
| 4536.711065945632 | 99.5 |
| 4540.686824289042 | 99.485 |
| 4544.669557076505 | 99.472 |
| 4548.659282676432 | 99.458 |
| 4552.656019521789 | 99.441 |
| 4556.639023056594 | 99.427 |
| 4560.649801383702 | 99.414 |
| 4564.667646548655 | 99.397 |
| 4568.6925772451705 | 99.381 |
| 4572.7246122329525 | 99.369 |
| 4576.763770337994 | 99.355 |
| 4580.810070452859 | 99.334 |
| 4584.842510659759 | 99.313 |
| 4588.903114488543 | 99.305 |
| 4592.970917308152 | 99.302 |
| 4597.045938280061 | 99.295 |
| 4601.128196633814 | 99.284 |
| 4605.217711667319 | 99.269 |
| 4609.293257064894 | 99.25 |
| 4613.397305775973 | 99.231 |
| 4617.508669372526 | 99.213 |
| 4621.627367428619 | 99.199 |
| 4625.753419588215 | 99.186 |
| 4629.886845565494 | 99.173 |
| 4634.027665145161 | 99.154 |
| 4638.154385606879 | 99.125 |
| 4642.310013462699 | 99.099 |
| 4646.473094597545 | 99.083 |
| 4650.643649081033 | 99.068 |
| 4654.821697054895 | 99.045 |
| 4659.007258733309 | 99.019 |
| 4663.178609067084 | 98.992 |
| 4667.3792198942365 | 98.967 |
| 4671.587405400355 | 98.941 |
| 4675.803186092291 | 98.914 |
| 4680.02658255099 | 98.883 |
| 4684.257615431818 | 98.852 |
| 4688.496305464911 | 98.827 |
| 4692.720651725044 | 98.802 |
| 4696.9746786095075 | 98.78 |
| 4701.236425179823 | 98.757 |
| 4705.505912468178 | 98.735 |
| 4709.783161583241 | 98.713 |
| 4714.06819371049 | 98.695 |
| 4718.338767286814 | 98.675 |
| 4722.639388701557 | 98.651 |
| 4726.947857038189 | 98.621 |
| 4731.264193792582 | 98.589 |
| 4735.588420539194 | 98.556 |
| 4739.920558931432 | 98.522 |
| 4744.260630702009 | 98.489 |
| 4748.586108486198 | 98.464 |
| 4752.942071142037 | 98.441 |
| 4757.30603273978 | 98.416 |
| 4761.6780153326035 | 98.389 |
| 4766.058041054824 | 98.365 |
| 4770.446132122276 | 98.341 |
| 4774.819511822453 | 98.316 |
| 4779.223758477148 | 98.287 |
| 4783.636137500837 | 98.25 |
| 4788.056671438762 | 98.209 |
| 4792.485382919583 | 98.173 |
| 4796.922294655749 | 98.143 |
| 4801.367429443906 | 98.111 |
| 4805.797714362607 | 98.07 |
| 4810.25932108 | 98.024 |
| 4814.729219628688 | 97.986 |
| 4819.207433145545 | 97.96 |
| 4823.693984853601 | 97.935 |
| 4828.188898062447 | 97.904 |
| 4832.668841367645 | 97.868 |
| 4837.180504227696 | 97.826 |
| 4841.700598918364 | 97.778 |
| 4846.2291490990865 | 97.732 |
| 4850.766178517896 | 97.693 |
| 4855.311711011847 | 97.657 |
| 4859.865770507418 | 97.619 |
| 4864.404718472577 | 97.578 |
| 4868.975859617688 | 97.534 |
| 4873.555599959062 | 97.494 |
| 4878.143963784659 | 97.458 |
| 4882.740975473991 | 97.418 |
| 4887.346659498558 | 97.373 |
| 4891.937109256523 | 97.323 |
| 4896.5601664830465 | 97.271 |
| 4901.191969887076 | 97.223 |
| 4905.832544311933 | 97.182 |
| 4910.481914695108 | 97.144 |
| 4915.140106068724 | 97.101 |
| 4919.807143559972 | 97.057 |
| 4924.458801977663 | 97.014 |
| 4929.143561306223 | 96.971 |
| 4933.837242577041 | 96.924 |
| 4938.539871301651 | 96.874 |
| 4943.251473088939 | 96.826 |
| 4947.972073645617 | 96.78 |
| 4952.677169644051 | 96.729 |
| 4957.415798292666 | 96.671 |
| 4962.163503287434 | 96.614 |
| 4966.920310730535 | 96.569 |
| 4971.686246824335 | 96.529 |
| 4976.461337871866 | 96.484 |
| 4981.245610277307 | 96.431 |
| 4986.014230084613 | 96.375 |
| 4990.816896909686 | 96.322 |
| 4995.6288247783195 | 96.27 |
| 5000.450040503646 | 96.215 |
| 5005.280571002407 | 96.156 |
| 5010.120443295457 | 96.097 |
| 5014.944534713446 | 96.036 |
| 5019.803123321503 | 95.968 |
| 5024.671135274196 | 95.905 |
| 5029.548598013328 | 95.855 |
| 5034.435539087358 | 95.814 |
| 5039.331986151916 | 95.771 |
| 5044.23796697033 | 95.719 |
| 5049.1280155917075 | 95.655 |
| 5054.053097881846 | 95.586 |
| 5058.987797721432 | 95.52 |
| 5063.932143309279 | 95.463 |
| 5068.886162954553 | 95.407 |
| 5073.849885077299 | 95.345 |
| 5078.797543893508 | 95.27 |
| 5083.780706035464 | 95.189 |
| 5088.773656436536 | 95.121 |
| 5093.776423965199 | 95.066 |
| 5098.789037603569 | 95.008 |
| 5103.811526447951 | 94.941 |
| 5108.8439197094085 | 94.872 |
| 5113.8600950155205 | 94.807 |
| 5118.912333507376 | 94.747 |
| 5123.974564590261 | 94.689 |
| 5129.046817939354 | 94.627 |
| 5134.129123347452 | 94.558 |
| 5139.221510725555 | 94.481 |
| 5144.29754617007 | 94.396 |
| 5149.410135069028 | 94.311 |
| 5154.532896228944 | 94.246 |
| 5159.665860038905 | 94.198 |
| 5164.809057009162 | 94.145 |
| 5169.962517771746 | 94.078 |
| 5175.126273081063 | 94.003 |
| 5180.273518441773 | 93.927 |
| 5185.457901860023 | 93.855 |
| 5190.652672667062 | 93.782 |
| 5195.857862112324 | 93.697 |
| 5201.073501570723 | 93.603 |
| 5206.299622543277 | 93.517 |
| 5211.536256657738 | 93.437 |
| 5216.756220981793 | 93.355 |
| 5222.013921889115 | 93.286 |
| 5227.282231422239 | 93.228 |
| 5232.561181721618 | 93.155 |
| 5237.850805057668 | 93.061 |
| 5243.151133831432 | 92.97 |
| 5248.434654364336 | 92.895 |
| 5253.756435851634 | 92.827 |
| 5259.089020599852 | 92.759 |
| 5264.432441538478 | 92.69 |
| 5269.786731730967 | 92.612 |
| 5275.151924375422 | 92.517 |
| 5280.528052805281 | 92.42 |
| 5285.887209738718 | 92.334 |
| 5291.285253187999 | 92.244 |
| 5296.694333066733 | 92.151 |
| 5302.114483255923 | 92.076 |
| 5307.5457377753955 | 92.008 |
| 5312.988130784515 | 91.932 |
| 5318.4134109112565 | 91.847 |
| 5323.878125781945 | 91.759 |
| 5329.354082285227 | 91.673 |
| 5334.84131514508 | 91.59 |
| 5340.339859228641 | 91.504 |
| 5345.849749546939 | 91.39 |
| 5351.371021255645 | 91.238 |
| 5356.875013392188 | 91.116 |
| 5362.419094501912 | 91.066 |
| 5367.97466315959 | 91.031 |
| 5373.541755106208 | 90.969 |
| 5379.120406231174 | 90.88 |
| 5384.710652573084 | 90.781 |
| 5390.28347500795 | 90.687 |
| 5395.896959951653 | 90.6 |
| 5401.522148941572 | 90.515 |
| 5407.159078620092 | 90.42 |
| 5412.807785782718 | 90.306 |
| 5418.468307378871 | 90.164 |
| 5424.14068051269 | 90.02 |
| 5429.795459605036 | 89.932 |
| 5435.491585859025 | 89.883 |
| 5441.1996757045 | 89.817 |
| 5446.919766871834 | 89.726 |
| 5452.651897250227 | 89.632 |
| 5458.39610488854 | 89.527 |
| 5464.122571197518 | 89.389 |
| 5469.890985072668 | 89.256 |
| 5475.671591120651 | 89.164 |
| 5481.464428036595 | 89.082 |
| 5487.269534679543 | 89.005 |
| 5493.086950073332 | 88.933 |
| 5498.916713407459 | 88.85 |
| 5504.728561834616 | 88.753 |
| 5510.583074795144 | 88.652 |
| 5516.450054061211 | 88.543 |
| 5522.32953949294 | 88.421 |
| 5528.221571120571 | 88.308 |
| 5534.126189145365 | 88.217 |
| 5540.0127420293065 | 88.132 |
| 5545.942588402325 | 88.03 |
| 5551.885142600169 | 87.896 |
| 5557.84044551649 | 87.758 |
| 5563.808538220583 | 87.647 |
| 5569.789461958338 | 87.544 |
| 5575.783258153189 | 87.404 |
| 5581.758812201725 | 87.249 |
| 5587.778411059332 | 87.161 |
| 5593.811007501301 | 87.118 |
| 5599.856643669922 | 87.048 |
| 5605.915361889866 | 86.936 |
| 5611.9872046691735 | 86.806 |
| 5618.040652142158 | 86.682 |
| 5624.138803745676 | 86.577 |
| 5630.2502083192585 | 86.477 |
| 5636.374909113455 | 86.339 |
| 5642.512949567219 | 86.145 |
| 5648.664373308931 | 85.987 |
| 5654.82922415743 | 85.916 |
| 5660.975499298039 | 85.868 |
| 5667.167266441869 | 85.799 |
| 5673.372593071677 | 85.69 |
| 5679.59152377761 | 85.551 |
| 5685.824103345539 | 85.427 |
| 5692.070376758139 | 85.316 |
| 5698.29791841177 | 85.211 |
| 5704.571643715273 | 85.099 |
| 5710.859198766455 | 84.931 |
| 5717.160629345042 | 84.708 |
| 5723.475981433044 | 84.541 |
| 5729.805301215864 | 84.448 |
| 5736.148635083432 | 84.362 |
| 5742.4730534451965 | 84.247 |
| 5748.844482259065 | 84.12 |
| 5755.230065321862 | 84.008 |
| 5761.629849851926 | 83.873 |
| 5768.043883277864 | 83.65 |
| 5774.47221323971 | 83.459 |
| 5780.881468806363 | 83.389 |
| 5787.338460915209 | 83.353 |
| 5793.809893509774 | 83.292 |
| 5800.29581508657 | 83.193 |
| 5806.796274359511 | 83.071 |
| 5813.311320261134 | 82.928 |
| 5819.841001943827 | 82.694 |
| 5826.351422212382 | 82.381 |
| 5832.910447325901 | 82.221 |
| 5839.484256750444 | 82.194 |
| 5846.07290052907 | 82.157 |
| 5852.67642893095 | 82.06 |
| 5859.294892452642 | 81.883 |
| 5865.893932905905 | 81.675 |
| 5872.542341030279 | 81.507 |
| 5879.205836875554 | 81.327 |
| 5885.884471859586 | 81.077 |
| 5892.57829763413 | 80.859 |
| 5899.287366086178 | 80.752 |
| 5906.011729339294 | 80.706 |
| 5912.7164793321 | 80.648 |
| 5919.4715095836245 | 80.54 |
| 5926.241992165508 | 80.388 |
| 5933.0279801599545 | 80.159 |
| 5939.829526892578 | 79.843 |
| 5946.6466859338025 | 79.665 |
| 5953.479511100262 | 79.624 |
| 5960.292531157429 | 79.56 |
| 5967.15676914264 | 79.413 |
| 5974.03683591113 | 79.219 |
| 5980.932786277347 | 79.036 |
| 5987.844675309122 | 78.848 |
| 5994.772558329138 | 78.686 |
| 6001.680470531749 | 78.597 |
| 6008.640424931051 | 78.493 |
| 6015.61654053924 | 78.321 |
| 6022.608873711914 | 78.154 |
| 6029.617481067002 | 78.045 |
| 6036.642419486282 | 77.937 |
| 6043.683746116933 | 77.715 |
| 6050.70490712168 | 77.318 |
| 6057.779097027447 | 77.069 |
| 6064.869847893065 | 76.97 |
| 6071.977217941478 | 76.806 |
| 6079.101265668884 | 76.644 |
| 6086.242049846323 | 76.572 |
| 6093.362500228501 | 76.506 |
| 6100.536847242557 | 76.386 |
| 6107.728108375528 | 76.17 |
| 6114.936343512664 | 75.897 |
| 6122.161612822255 | 75.765 |
| 6129.4039767572995 | 75.736 |
| 6136.663496057194 | 75.685 |
| 6143.902483979774 | 75.587 |
| 6151.196407701298 | 75.476 |
| 6158.507670421303 | 75.382 |
| 6165.836334040349 | 75.331 |
| 6173.182460753992 | 75.315 |
| 6180.546113054549 | 75.287 |
| 6187.889063524869 | 75.262 |
| 6195.287864050603 | 75.304 |
| 6202.704379109291 | 75.37 |
| 6210.138672396555 | 75.403 |
| 6217.59080791375 | 75.406 |
| 6225.060849969808 | 75.407 |
| 6232.548863183088 | 75.405 |
| 6240.015974440895 | 75.385 |
| 6247.540031112749 | 75.354 |
| 6255.082254331644 | 75.319 |
| 6262.6427099707535 | 75.274 |
| 6270.221464222117 | 75.215 |
| 6277.818583598571 | 75.148 |
| 6285.39462850175 | 75.076 |
| 6293.028582935824 | 74.999 |
| 6300.681103627301 | 74.919 |
| 6308.352258390109 | 74.835 |
| 6316.042115368825 | 74.744 |
| 6323.750743040713 | 74.642 |
| 6331.478210217739 | 74.518 |
| 6339.184400535027 | 74.342 |
| 6346.949655995329 | 74.147 |
| 6354.7339590628035 | 74.047 |
| 6362.537379907107 | 73.987 |
| 6370.3599890429805 | 73.871 |
| 6378.201857332381 | 73.737 |
| 6386.022274445693 | 73.649 |
| 6393.902774314414 | 73.582 |
| 6401.80274765374 | 73.497 |
| 6409.722266734182 | 73.301 |
| 6417.661404184315 | 72.926 |
| 6425.620232992989 | 72.762 |
| 6433.598826511575 | 72.796 |
| 6441.555764548253 | 72.808 |
| 6449.574005636928 | 72.766 |
| 6457.612233300615 | 72.691 |
| 6465.670522361522 | 72.593 |
| 6473.7489480157965 | 72.439 |
| 6481.847585835867 | 72.176 |
| 6489.924392380829 | 71.842 |
| 6498.0635770540375 | 71.725 |
| 6506.2232024931845 | 71.785 |
| 6514.403345797558 | 71.8 |
| 6522.604084454677 | 71.731 |
| 6530.825496342738 | 71.654 |
| 6539.067659733076 | 71.588 |
| 6547.287786034635 | 71.477 |
| 6555.571580286085 | 71.317 |
| 6563.87636282483 | 71.141 |
| 6572.202213517706 | 70.957 |
| 6580.549212637286 | 70.82 |
| 6588.917440864466 | 70.751 |
| 6597.263455118818 | 70.705 |
| 6605.674274201539 | 70.665 |
| 6614.106566484999 | 70.61 |
| 6622.56041430738 | 70.496 |
| 6631.0359004283655 | 70.249 |
| 6639.533108031843 | 69.993 |
| 6648.0521207286265 | 69.982 |
| 6656.548712623479 | 70.026 |
| 6665.111473989403 | 69.994 |
| 6673.696293429078 | 69.866 |
| 6682.303256286377 | 69.712 |
| 6690.932448346001 | 69.64 |
| 6699.583955836342 | 69.597 |
| 6708.212865010632 | 69.48 |
| 6716.909147086876 | 69.301 |
| 6725.6280055150155 | 69.198 |
| 6734.369528324758 | 69.159 |
| 6743.133804004073 | 69.101 |
| 6751.920921502168 | 69.008 |
| 6760.730970232501 | 68.898 |
| 6769.518213388753 | 68.768 |
| 6778.374274713952 | 68.589 |
| 6787.253537855907 | 68.368 |
| 6796.156094113169 | 68.222 |
| 6805.082035263936 | 68.181 |
| 6814.0314535691905 | 68.144 |
| 6822.957888703911 | 68.051 |
| 6831.954417200128 | 67.938 |
| 6840.974702075551 | 67.857 |
| 6850.018837551804 | 67.757 |
| 6859.086918349429 | 67.544 |
| 6868.1790396912065 | 67.32 |
| 6877.295297305476 | 67.275 |
| 6886.388364758219 | 67.279 |
| 6895.553057833004 | 67.234 |
| 6904.742176927113 | 67.136 |
| 6913.955819822312 | 67.027 |
| 6923.194084822973 | 66.943 |
| 6932.457070759589 | 66.866 |
| 6941.696689504849 | 66.773 |
| 6951.009286548407 | 66.646 |
| 6960.3469036896795 | 66.475 |
| 6969.709641896319 | 66.323 |
| 6979.0976026799735 | 66.226 |
| 6988.510888099963 | 66.133 |
| 6997.949600766975 | 66.036 |
| 7007.364740342099 | 65.955 |
| 7016.854484471701 | 65.871 |
| 7026.369966484215 | 65.766 |
| 7035.91129123044 | 65.644 |
| 7045.478564131468 | 65.49 |
| 7055.071891182572 | 65.341 |
| 7064.69137895711 | 65.265 |
| 7074.2870887186355 | 65.225 |
| 7083.959083052336 | 65.168 |
| 7093.657560774911 | 65.085 |
| 7103.382630808791 | 64.989 |
| 7113.134402674538 | 64.885 |
| 7122.912986494956 | 64.777 |
| 7132.667617689016 | 64.674 |
| 7142.50001785625 | 64.558 |
| 7152.359563419972 | 64.424 |
| 7162.2463669505305 | 64.298 |
| 7172.160541641564 | 64.208 |
| 7182.102201314325 | 64.152 |
| 7192.07146042203 | 64.088 |
| 7202.016564638098 | 63.978 |
| 7212.041224027636 | 63.848 |
| 7222.093829443032 | 63.757 |
| 7232.174497906286 | 63.691 |
| 7242.283347093671 | 63.609 |
| 7252.4204953403205 | 63.506 |
| 7262.533316871591 | 63.391 |
| 7272.727272727272 | 63.268 |
| 7282.949886021835 | 63.161 |
| 7293.201277768863 | 63.082 |
| 7303.481569664258 | 63.014 |
| 7313.790884091042 | 62.938 |
| 7324.129344124218 | 62.845 |
| 7334.443279082901 | 62.725 |
| 7344.840249724569 | 62.606 |
| 7355.266738748281 | 62.529 |
| 7365.722872042662 | 62.467 |
| 7376.208776213201 | 62.387 |
| 7386.724578587363 | 62.293 |
| 7397.215688015031 | 62.194 |
| 7407.7915151155985 | 62.089 |
| 7418.397626112759 | 61.979 |
| 7429.034151269993 | 61.881 |
| 7439.701221598941 | 61.795 |
| 7450.398968864783 | 61.701 |
| 7461.127525591667 | 61.581 |
| 7471.831196389612 | 61.461 |
| 7482.621611307738 | 61.371 |
| 7493.443237167478 | 61.291 |
| 7504.296209579985 | 61.197 |
| 7515.180664943185 | 61.091 |
| 7526.096740447501 | 60.984 |
| 7536.987767468853 | 60.881 |
| 7547.967332397386 | 60.776 |
| 7558.978933125713 | 60.67 |
| 7570.02271006813 | 60.563 |
| 7581.098804460719 | 60.456 |
| 7592.207358367372 | 60.351 |
| 7603.3485146858675 | 60.249 |
| 7614.464436643849 | 60.148 |
| 7625.6710590531975 | 60.05 |
| 7636.910716876809 | 59.953 |
| 7648.183556405354 | 59.857 |
| 7659.489724794535 | 59.759 |
| 7670.829370071491 | 59.657 |
| 7682.143625357219 | 59.55 |
| 7693.5504966186845 | 59.443 |
| 7704.991293359839 | 59.337 |
| 7716.46616715409 | 59.233 |
| 7727.975270479135 | 59.132 |
| 7739.518756723707 | 59.033 |
| 7751.096780194397 | 58.935 |
| 7762.64923693158 | 58.833 |
| 7774.296620513259 | 58.728 |
| 7785.979009000593 | 58.622 |
| 7797.696560436047 | 58.514 |
| 7809.449433814916 | 58.41 |
| 7821.237789092503 | 58.311 |
| 7833.000430815023 | 58.21 |
| 7844.860047696749 | 58.098 |
| 7856.755631329599 | 57.977 |
| 7868.687345577012 | 57.856 |
| 7880.655355299346 | 57.741 |
| 7892.659826361484 | 57.636 |
| 7904.700925640479 | 57.533 |
| 7916.71614614258 | 57.424 |
| 7928.830814608077 | 57.31 |
| 7940.982617189051 | 57.201 |
| 7953.171724883885 | 57.098 |
| 7965.398309742478 | 56.997 |
| 7977.662544874352 | 56.889 |
| 7989.900765432494 | 56.772 |
| 8002.240627375665 | 56.653 |
| 8014.618664443946 | 56.542 |
| 8027.035054062081 | 56.445 |
| 8039.489974756002 | 56.351 |
| 8051.983606161377 | 56.246 |
| 8064.516129032258 | 56.127 |
| 8077.022486430602 | 56.007 |
| 8089.633135137321 | 55.894 |
| 8102.283223412357 | 55.782 |
| 8114.972936565257 | 55.666 |
| 8127.702461068307 | 55.549 |
| 8140.471984565665 | 55.438 |
| 8153.215220422174 | 55.333 |
| 8166.065099870977 | 55.224 |
| 8178.9555473765995 | 55.111 |
| 8191.886755357494 | 54.991 |
| 8204.858917450914 | 54.862 |
| 8217.87222852259 | 54.733 |
| 8230.926884676483 | 54.617 |
| 8243.955119908327 | 54.506 |
| 8257.092842751925 | 54.387 |
| 8270.272505479055 | 54.263 |
| 8283.49430923941 | 54.141 |
| 8296.758456471058 | 54.016 |
| 8310.065150910785 | 53.887 |
| 8323.345318950593 | 53.759 |
| 8336.737501146301 | 53.633 |
| 8350.172848577966 | 53.498 |
| 8363.651570275582 | 53.359 |
| 8377.173876620984 | 53.227 |
| 8390.739979358781 | 53.106 |
| 8404.350091607415 | 52.982 |
| 8417.9335656683 | 52.843 |
| 8431.632111027731 | 52.696 |
| 8445.375312478887 | 52.554 |
| 8459.163388740853 | 52.422 |
| 8472.996559963396 | 52.29 |
| 8486.875047738673 | 52.155 |
| 8500.726812142439 | 52.024 |
| 8514.696365927592 | 51.89 |
| 8528.711908640438 | 51.739 |
| 8542.773667754447 | 51.577 |
| 8556.881872245754 | 51.417 |
| 8571.036752605594 | 51.262 |
| 8585.238540852857 | 51.113 |
| 8599.413519997937 | 50.966 |
| 8613.709580167795 | 50.81 |
| 8628.053252344673 | 50.652 |
| 8642.444774777889 | 50.501 |
| 8656.884387309006 | 50.347 |
| 8671.372331385164 | 50.179 |
| 8685.908850072527 | 50.003 |
| 8700.418490129376 | 49.829 |
| 8715.05263891794 | 49.662 |
| 8729.736100077695 | 49.504 |
| 8744.469123279525 | 49.35 |
| 8759.251959882626 | 49.189 |
| 8774.084862948794 | 49.01 |
| 8788.890841975743 | 48.815 |
| 8803.824381311242 | 48.619 |
| 8818.808755313332 | 48.434 |
| 8833.844223990955 | 48.25 |
| 8848.931049129267 | 48.064 |
| 8864.069494304835 | 47.883 |
| 8879.259824900997 | 47.698 |
| 8894.423196655698 | 47.5 |
| 8909.71782923635 | 47.292 |
| 8925.065152975616 | 47.094 |
| 8940.46544063084 | 46.909 |
| 8955.918966845189 | 46.721 |
| 8971.426008163997 | 46.522 |
| 8986.90607784458 | 46.322 |
| 9002.520705797624 | 46.127 |
| 9018.189688601911 | 45.925 |
| 9033.913310567872 | 45.714 |
| 9049.691857992235 | 45.503 |
| 9065.5256191754 | 45.289 |
| 9081.414884438995 | 45.072 |
| 9097.277184938548 | 44.856 |
| 9113.278046113188 | 44.65 |
| 9129.33529309731 | 44.451 |
| 9145.449224465905 | 44.248 |
| 9161.620140905718 | 44.026 |
| 9177.848345233944 | 43.789 |
| 9194.049611091701 | 43.544 |
| 9210.393007469629 | 43.299 |
| 9226.794611551946 | 43.059 |
| 9243.254734857239 | 42.832 |
| 9259.773691130988 | 42.609 |
| 9276.351796365525 | 42.376 |
| 9292.989368820163 | 42.127 |
| 9309.60005958144 | 41.876 |
| 9326.357218134168 | 41.632 |
| 9343.17481080071 | 41.382 |
| 9360.05316510198 | 41.121 |
| 9376.992610929821 | 40.859 |
| 9393.993480568524 | 40.598 |
| 9410.967541572949 | 40.326 |
| 9428.091942752624 | 40.043 |
| 9445.278777403115 | 39.764 |
| 9462.528387585164 | 39.492 |
| 9479.841117862865 | 39.213 |
| 9497.217315326609 | 38.917 |
| 9514.657329616273 | 38.616 |
| 9532.070651707672 | 38.328 |
| 9549.639023644906 | 38.052 |
| 9567.272275001675 | 37.772 |
| 9584.970765839165 | 37.478 |
| 9602.734858887812 | 37.176 |
| 9620.564919572076 | 36.879 |
| 9638.368416994372 | 36.592 |
| 9656.331173533928 | 36.303 |
| 9674.361008455391 | 35.994 |
| 9692.458298198173 | 35.67 |
| 9710.623422023695 | 35.352 |
| 9728.856762041893 | 35.051 |
| 9747.158703238005 | 34.753 |
| 9765.434268861936 | 34.437 |
| 9783.874218513047 | 34.105 |
| 9802.383939774152 | 33.773 |
| 9820.963829390215 | 33.444 |
| 9839.614287119944 | 33.11 |
| 9858.335715764464 | 32.766 |
| 9877.030964492073 | 32.421 |
| 9895.895182678225 | 32.076 |
| 9914.831596585333 | 31.732 |
| 9933.84062146107 | 31.395 |
| 9952.922675743732 | 31.063 |
| 9972.07818109294 | 30.725 |
| 9991.307562420694 | 30.376 |
| 10010.55112088141 | 30.022 |
| 10029.9091892022 | 29.67 |
| 10049.352369486549 | 29.318 |
| 10068.860939968445 | 28.956 |
| 10088.455578512398 | 28.574 |
| 10108.116413155107 | 28.178 |
| 10127.864286618558 | 27.789 |
| 10147.679175034273 | 27.423 |
| 10167.582087973986 | 27.07 |
| 10187.552847930398 | 26.708 |
| 10207.612633349701 | 26.333 |
| 10227.741111325895 | 25.956 |
| 10247.959631237421 | 25.576 |
| 10268.247702992989 | 25.183 |
| 10288.616263421502 | 24.778 |
| 10309.076420152594 | 24.377 |
| 10329.60744392831 | 23.991 |
| 10350.231120660925 | 23.618 |
| 10370.926559320662 | 23.24 |
| 10391.715724224649 | 22.847 |
| 10412.577560687107 | 22.444 |
| 10433.534213645393 | 22.035 |
| 10454.564462844479 | 21.618 |
| 10475.69063609441 | 21.195 |
| 10496.891345627992 | 20.781 |
| 10518.18910441827 | 20.387 |
| 10539.562355212762 | 20.002 |
| 10561.033798476465 | 19.608 |
| 10582.581705467703 | 19.205 |
| 10604.228966511846 | 18.8 |
| 10625.953679342721 | 18.388 |
| 10647.76758904728 | 17.958 |
| 10669.68263029016 | 17.516 |
| 10691.67663665513 | 17.087 |
| 10713.772983721492 | 16.681 |
| 10735.94932631918 | 16.288 |
| 10758.22923850026 | 15.89 |
| 10780.590194190772 | 15.488 |
| 10803.055968472363 | 15.093 |
| 10825.603852182874 | 14.706 |
| 10848.257824034748 | 14.322 |
| 10870.99498955841 | 13.935 |
| 10893.839533743669 | 13.549 |
| 10916.76837455869 | 13.159 |
| 10939.805905963616 | 12.767 |
| 10962.92885607319 | 12.394 |
| 10986.149760996312 | 12.045 |
| 11009.481365351841 | 11.705 |
| 11032.900108122421 | 11.365 |
| 11056.43091776116 | 11.022 |
| 11080.05003750597 | 10.68 |
| 11103.782614585483 | 10.344 |
| 11127.604694068763 | 10.022 |
| 11151.541644874696 | 9.71 |
| 11175.569311439649 | 9.399 |
| 11199.713287339844 | 9.084 |
| 11223.949213874597 | 8.77 |
| 11248.302912298106 | 8.473 |
| 11272.74981822691 | 8.193 |
| 11297.3159836686 | 7.917 |
| 11321.976635969013 | 7.64 |
| 11346.745186143355 | 7.367 |
| 11371.63527526749 | 7.097 |
| 11396.621813362082 | 6.821 |
| 11421.731443112923 | 6.542 |
| 11446.938859610163 | 6.272 |
| 11472.27094750633 | 6.02 |
| 11497.702184218484 | 5.778 |
| 11523.259699703853 | 5.542 |
| 11548.917750917562 | 5.31 |
| 11574.703716521617 | 5.075 |
| 11600.59163017314 | 4.83 |
| 11626.609122702583 | 4.586 |
| 11652.730001584772 | 4.363 |
| 11678.982153347371 | 4.157 |
| 11705.339156349386 | 3.946 |
| 11731.815392845703 | 3.729 |
| 11758.425499791876 | 3.528 |
| 11785.142706293032 | 3.345 |
| 11811.995553964873 | 3.161 |
| 11838.957035241023 | 2.961 |
| 11866.055960319909 | 2.757 |
| 11893.26508184945 | 2.571 |
| 11920.613482452261 | 2.412 |
| 11948.07367182226 | 2.262 |
| 11975.675008921879 | 2.093 |
| 12003.389757267452 | 1.914 |
| 12031.247556152839 | 1.753 |
| 12059.220419636751 | 1.613 |
| 12087.338271413928 | 1.471 |
| 12115.572872747714 | 1.322 |
| 12143.939688337932 | 1.181 |
| 12172.454465890956 | 1.058 |
| 12201.088581123207 | 0.946 |
| 12229.872687025329 | 0.836 |
| 12258.777897913802 | 0.724 |
| 12287.835166063947 | 0.617 |
| 12317.015340842607 | 0.521 |
| 12346.349678254126 | 0.435 |
| 12375.808759102407 | 0.359 |
| 12405.42414765432 | 0.295 |
| 12435.166152472546 | 0.239 |
| 12465.066650711382 | 0.191 |
| 12495.095674947583 | 0.15 |
| 12525.285419941507 | 0.105 |
| 12555.605638471381 | 0.051 |
| 12586.073006775083 | 0.004 |
| 12616.704516780217 | 0 |
| 12647.46949430358 | 0 |
| 12678.400949358662 | 0 |
| 12709.467918125607 | 0 |
| 12740.703745512088 | 0 |
| 12772.077173999116 | 0 |
| 12803.621888559835 | 0 |
| 12835.306333838616 | 0 |
| 12867.164540153273 | 0 |
| 12899.164650097258 | 0 |
| 12931.341044723044 | 0 |
| 12963.66156028038 | 0 |
| 12996.160934060079 | 0 |
| 13028.806691595117 | 0 |
| 13061.616871429282 | 0 |
| 13094.609865740966 | 0 |
| 13127.75272564966 | 0 |
| 13161.081103846192 | 0 |
| 13194.561729437595 | 0 |
| 13228.230631555416 | 0 |
| 13262.054212625211 | 0 |
| 13296.068884273676 | 0 |
| 13330.240717486877 | 0 |
| 13364.606512572755 | 0 |
| 13399.132004228766 | 0 |
| 13433.85438776552 | 0 |
| 13468.739056649516 | 0 |
| 13503.823607654509 | 0 |
| 13539.073087978253 | 0 |
| 13574.525502461063 | 0 |
| 13610.14554689648 | 0 |
| 13645.953019712944 | 0 |
| 13681.968123750665 | 0 |
| 13718.155017895333 | 0 |
| 13754.552756962554 | 0 |
| 13791.125135153026 | 0 |
| 13827.911639644624 | 0 |
| 13864.875694456963 | 0 |
| 13902.057226428367 | 0 |
| 13939.419283792638 | 0 |
| 13977.002240513459 | 0 |
| 14014.76876332279 | 0 |
| 14052.759680946145 | 0 |
| 14090.937272783636 | 0 |
| 14129.342830135629 | 0 |
| 14167.938239123629 | 0 |
| 14206.745078428337 | 0 |
| 14245.785384394027 | 0 |
| 14285.020441864253 | 0 |
| 14324.492733901061 | 0 |
| 14364.163136673575 | 0 |
| 14404.074624629815 | 0 |
| 14444.187658886063 | 0 |
| 14484.545713950502 | 0 |
| 14525.108829377905 | 0 |
| 14565.92098861819 | 0 |
| 14606.94180302247 | 0 |
| 14648.215774077638 | 0 |
| 14689.702078152151 | 0 |
| 14731.445744085324 | 0 |
| 14773.405506343699 | 0 |
| 14815.60498041377 | 0 |
| 14858.068302539987 | 0 |
| 14900.75353110607 | 0 |
| 14943.70705552185 | 0 |
| 14986.886474334957 | 0 |
| 15030.338738744154 | 0 |
| 15074.0209800224 | 0 |
| 15117.980721550983 | 0 |
| 15162.174619732661 | 0 |
| 15206.650780785485 | 0 |
| 15251.365378485509 | 0 |
| 15296.367112810707 | 0 |
| 15341.61166698884 | 0 |
| 15387.148345958489 | 0 |
| 15432.93233430818 | 0 |
| 15478.989593475297 | 0 |
| 15525.346680991388 | 0 |
| 15571.958018001185 | 0 |
| 15618.874472667752 | 0 |
| 15666.04994650044 | 0 |
| 15713.535954141616 | 0 |
| 15761.285868746314 | 0 |
| 15809.35186400163 | 0 |
| 15857.686775799266 | 0 |
| 15906.34344976777 | 0 |
| 15955.274175431432 | 0 |
| 16004.532483599356 | 0 |
| 16054.070108124162 | 0 |
| 16103.941278588522 | 0 |
| 16154.097163663622 | 0 |
| 16204.566446824714 | 0 |
| 16255.378498360646 | 0 |
| 16306.483620952527 | 0 |
| 16357.93785292251 | 0 |
| 16409.690907062075 | 0 |
| 16461.799571005504 | 0 |
| 16514.212957381773 | 0 |
| 16566.98861847882 | 0 |
| 16620.075056258956 | 0 |
| 16673.530603431744 | 0 |
| 16727.303140551165 | 0 |
| 16781.45179695786 | 0 |
| 16835.923820811895 | 0 |
| 16890.77915475163 | 0 |
| 16945.964403307175 | 0 |
| 17001.511434366515 | 0 |
| 17057.452912901234 | 0 |
| 17113.73445645068 | 0 |
| 17170.41811685156 | 0 |
| 17227.44883878381 | 0 |
| 17284.889549555777 | 0 |
| 17342.68450882049 | 0 |
| 17400.897538295027 | 0 |
| 17459.47220015539 | 0 |
| 17518.473230021056 | 0 |
| 17577.84347985052 | 0 |
| 17637.648619236676 | 0 |
| 17697.830776881678 | 0 |
| 17758.456577021978 | 0 |
| 17819.467411757996 | 0 |
| 17880.89890854993 | 0 |
| 17942.787627371363 | 0 |
| 18005.073829805242 | 0 |
| 18067.826621135744 | 0 |
| 18130.98549158541 | 0 |
| 18194.620578479764 | 0 |
| 18258.67058619462 | 0 |
| 18323.206707759513 | 0 |
| 18388.166846870703 | 0 |
| 18453.623276662256 | 0 |
| 18519.51308496197 | 0 |
| 18585.909650176007 | 0 |
| 18652.749228708817 | 0 |
| 18720.10633020396 | 0 |
| 18787.916363711516 | 0 |
| 18856.21944113937 | 0 |
| 18925.056775170327 | 0 |
| 18994.362473217952 | 0 |
| 19064.213991989218 | 0 |
| 19134.54455000335 | 0 |
| 19205.43283283975 | 0 |
| 19276.81115279186 | 0 |
| 19348.759454287592 | 0 |
| 19421.209125637746 | 0 |
| 19494.24140109012 | 0 |
| 19567.786726778908 | 0 |
| 19641.92765878043 | 0 |
| 19716.593682409053 | 0 |
| 19791.868708659735 | 0 |
| 19867.68124292214 | 0 |
| 19944.116585327913 | 0 |
| 20021.10224176282 | 0 |
| 20098.684541096784 | 0 |
| 20176.911157024795 | 0 |
| 20255.708058530898 | 0 |
| 20335.16417594797 | 0 |
| 20415.204427649536 | 0 |
| 20495.919262474843 | 0 |
| 20577.232526843003 | 0 |
| 20659.236228036647 | 0 |
| 20741.853118641324 | 0 |
| 20825.17680575108 | 0 |
| 20909.128925688958 | 0 |
| 20993.8047282247 | 0 |
| 21079.124710425524 | 0 |
| 21165.185809166218 | 0 |
| 21251.907358685443 | 0 |
| 21339.34249217913 | 0 |
| 21427.545967442984 | 0 |
| 21516.435329126154 | 0 |
| 21606.111936944726 | 0 |
| 21696.49211115547 | 0 |
| 21787.679067487337 | 0 |
| 21879.587876082765 | 0 |
| 21972.323661116458 | 0 |
| 22065.800216244843 | 0 |
| 22160.12462854091 | 0 |
| 22255.209388137526 | 0 |
| 22351.1636015771 | 0 |
| 22447.898427749195 | 0 |
| 22545.52505146016 | 0 |
| 22643.953271938026 | 0 |
| 22743.244687746625 | 0 |
| 22843.462886225847 | 0 |
| 22944.515572442717 | 0 |
| 23046.519399407705 | 0 |
| 23149.380638321025 | 0 |
| 23253.218245405165 | 0 |
| 23357.937027001775 | 0 |
| 23463.658312822186 | 0 |
| 23570.285412586065 | 0 |
| 23677.942102695968 | 0 |
| 23786.5301636989 | 0 |
| 23896.175894971526 | 0 |
| 24006.779514534905 | 0 |
| 24118.469924268007 | 0 |
| 24231.14574549543 | 0 |
| 24344.87929808844 | 0 |
| 24459.745374050657 | 0 |
| 24575.64013398639 | 0 |
| 24692.699356508252 | 0 |
| 24810.817516437164 | 0 |
| 24930.133301422764 | 0 |
| 25050.539463367342 | 0 |